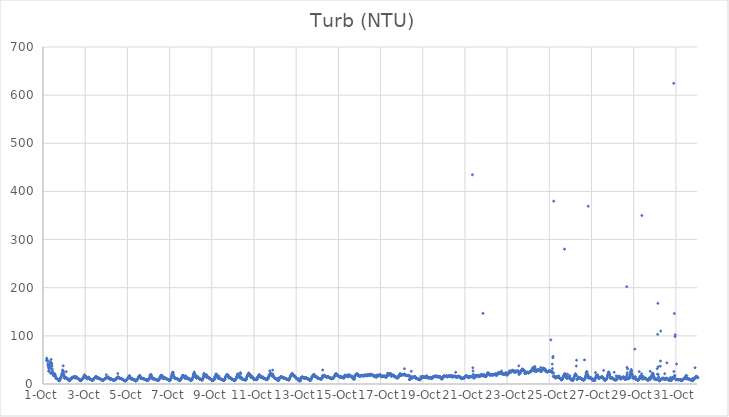
| Category | Turb (NTU) |
|---|---|
| 44835.166666666664 | 49.15 |
| 44835.177083333336 | 53.61 |
| 44835.1875 | 49.12 |
| 44835.197916666664 | 49.68 |
| 44835.208333333336 | 48.34 |
| 44835.21875 | 47.58 |
| 44835.229166666664 | 41.84 |
| 44835.239583333336 | 37.97 |
| 44835.25 | 38 |
| 44835.260416666664 | 33.62 |
| 44835.270833333336 | 26.23 |
| 44835.28125 | 28.36 |
| 44835.291666666664 | 31.49 |
| 44835.302083333336 | 37.87 |
| 44835.3125 | 36.7 |
| 44835.322916666664 | 41.82 |
| 44835.333333333336 | 44.21 |
| 44835.34375 | 46.5 |
| 44835.354166666664 | 32.95 |
| 44835.364583333336 | 22.28 |
| 44835.375 | 23.84 |
| 44835.385416666664 | 51.07 |
| 44835.395833333336 | 43.68 |
| 44835.40625 | 36.72 |
| 44835.416666666664 | 41.78 |
| 44835.427083333336 | 37.09 |
| 44835.4375 | 31.09 |
| 44835.447916666664 | 27.18 |
| 44835.458333333336 | 23.68 |
| 44835.46875 | 19.78 |
| 44835.479166666664 | 20.78 |
| 44835.489583333336 | 19.88 |
| 44835.5 | 17.16 |
| 44835.510416666664 | 18.75 |
| 44835.520833333336 | 17.98 |
| 44835.53125 | 18.2 |
| 44835.541666666664 | 21.58 |
| 44835.552083333336 | 21.3 |
| 44835.5625 | 19.48 |
| 44835.572916666664 | 18.64 |
| 44835.583333333336 | 16.84 |
| 44835.59375 | 15.21 |
| 44835.604166666664 | 14.49 |
| 44835.614583333336 | 12.2 |
| 44835.625 | 11.57 |
| 44835.635416666664 | 11.65 |
| 44835.645833333336 | 11.8 |
| 44835.65625 | 11.45 |
| 44835.666666666664 | 11.25 |
| 44835.677083333336 | 10.87 |
| 44835.6875 | 10.07 |
| 44835.697916666664 | 9.57 |
| 44835.708333333336 | 9.47 |
| 44835.71875 | 8.56 |
| 44835.729166666664 | 8.44 |
| 44835.739583333336 | 8.12 |
| 44835.75 | 7.13 |
| 44835.760416666664 | 6.82 |
| 44835.770833333336 | 7.75 |
| 44835.78125 | 6.8 |
| 44835.791666666664 | 7.42 |
| 44835.802083333336 | 8.4 |
| 44835.8125 | 11.02 |
| 44835.822916666664 | 12.06 |
| 44835.833333333336 | 12.48 |
| 44835.84375 | 12.3 |
| 44835.854166666664 | 12.15 |
| 44835.864583333336 | 15.31 |
| 44835.875 | 15.54 |
| 44835.885416666664 | 19.15 |
| 44835.895833333336 | 18.81 |
| 44835.90625 | 21.9 |
| 44835.916666666664 | 23.14 |
| 44835.927083333336 | 28.86 |
| 44835.9375 | 28.12 |
| 44835.947916666664 | 26.24 |
| 44835.958333333336 | 37.86 |
| 44835.96875 | 25.81 |
| 44835.979166666664 | 21.98 |
| 44835.989583333336 | 19.39 |
| 44836.0 | 16.69 |
| 44836.010416666664 | 16 |
| 44836.020833333336 | 12.04 |
| 44836.03125 | 12.14 |
| 44836.041666666664 | 13.37 |
| 44836.052083333336 | 13.4 |
| 44836.0625 | 13.37 |
| 44836.072916666664 | 13.4 |
| 44836.083333333336 | 13.68 |
| 44836.09375 | 11.85 |
| 44836.104166666664 | 25.61 |
| 44836.114583333336 | 12.76 |
| 44836.125 | 12.19 |
| 44836.135416666664 | 10.9 |
| 44836.145833333336 | 10.65 |
| 44836.15625 | 10.29 |
| 44836.166666666664 | 10.28 |
| 44836.177083333336 | 10.24 |
| 44836.1875 | 9.9 |
| 44836.197916666664 | 9.58 |
| 44836.208333333336 | 9.08 |
| 44836.21875 | 9.95 |
| 44836.229166666664 | 8.31 |
| 44836.239583333336 | 7.17 |
| 44836.25 | 6.77 |
| 44836.260416666664 | 7.12 |
| 44836.270833333336 | 7.86 |
| 44836.28125 | 7.98 |
| 44836.291666666664 | 8.83 |
| 44836.302083333336 | 11.41 |
| 44836.3125 | 10.06 |
| 44836.322916666664 | 11.19 |
| 44836.333333333336 | 11.21 |
| 44836.34375 | 12.52 |
| 44836.354166666664 | 12.64 |
| 44836.364583333336 | 12.93 |
| 44836.375 | 12.23 |
| 44836.385416666664 | 12.09 |
| 44836.395833333336 | 12.64 |
| 44836.40625 | 14.03 |
| 44836.416666666664 | 13.3 |
| 44836.427083333336 | 13.84 |
| 44836.4375 | 13.96 |
| 44836.447916666664 | 15.19 |
| 44836.458333333336 | 14.63 |
| 44836.46875 | 15.03 |
| 44836.479166666664 | 14.5 |
| 44836.489583333336 | 13.94 |
| 44836.5 | 13.4 |
| 44836.510416666664 | 12.65 |
| 44836.520833333336 | 12.65 |
| 44836.53125 | 12.82 |
| 44836.541666666664 | 14.99 |
| 44836.552083333336 | 15.46 |
| 44836.5625 | 14.48 |
| 44836.572916666664 | 14.25 |
| 44836.583333333336 | 13.58 |
| 44836.59375 | 12.76 |
| 44836.604166666664 | 12.78 |
| 44836.614583333336 | 12.74 |
| 44836.625 | 13.25 |
| 44836.635416666664 | 11.64 |
| 44836.645833333336 | 11.93 |
| 44836.65625 | 11.53 |
| 44836.666666666664 | 11.28 |
| 44836.677083333336 | 10.59 |
| 44836.6875 | 10.1 |
| 44836.697916666664 | 10.29 |
| 44836.708333333336 | 10.19 |
| 44836.71875 | 9.48 |
| 44836.729166666664 | 8.61 |
| 44836.739583333336 | 8.12 |
| 44836.75 | 8.36 |
| 44836.760416666664 | 7.26 |
| 44836.770833333336 | 8.08 |
| 44836.78125 | 6.84 |
| 44836.791666666664 | 7.87 |
| 44836.802083333336 | 7.08 |
| 44836.8125 | 7.45 |
| 44836.822916666664 | 8.35 |
| 44836.833333333336 | 9.28 |
| 44836.84375 | 9.24 |
| 44836.854166666664 | 9.94 |
| 44836.864583333336 | 10.49 |
| 44836.875 | 11.53 |
| 44836.885416666664 | 10.61 |
| 44836.895833333336 | 11.11 |
| 44836.90625 | 12.71 |
| 44836.916666666664 | 13.6 |
| 44836.927083333336 | 14.12 |
| 44836.9375 | 14.61 |
| 44836.947916666664 | 18.15 |
| 44836.958333333336 | 16.84 |
| 44836.96875 | 18.82 |
| 44836.979166666664 | 17.57 |
| 44836.989583333336 | 16.21 |
| 44837.0 | 16.41 |
| 44837.010416666664 | 16.79 |
| 44837.020833333336 | 16.39 |
| 44837.03125 | 15.18 |
| 44837.041666666664 | 14.75 |
| 44837.052083333336 | 13.43 |
| 44837.0625 | 12.53 |
| 44837.072916666664 | 11.91 |
| 44837.083333333336 | 11.25 |
| 44837.09375 | 10.67 |
| 44837.104166666664 | 11.48 |
| 44837.114583333336 | 11.26 |
| 44837.125 | 11.47 |
| 44837.135416666664 | 12.38 |
| 44837.145833333336 | 13.33 |
| 44837.15625 | 13.7 |
| 44837.166666666664 | 14.21 |
| 44837.177083333336 | 13.07 |
| 44837.1875 | 11.97 |
| 44837.197916666664 | 11.55 |
| 44837.208333333336 | 10.83 |
| 44837.21875 | 10.45 |
| 44837.229166666664 | 10.44 |
| 44837.239583333336 | 9.5 |
| 44837.25 | 9.91 |
| 44837.260416666664 | 9.92 |
| 44837.270833333336 | 9.36 |
| 44837.28125 | 9.79 |
| 44837.291666666664 | 8.82 |
| 44837.302083333336 | 8.54 |
| 44837.3125 | 7.99 |
| 44837.322916666664 | 7.9 |
| 44837.333333333336 | 7.79 |
| 44837.34375 | 7.48 |
| 44837.354166666664 | 7.73 |
| 44837.364583333336 | 8.03 |
| 44837.375 | 8.57 |
| 44837.385416666664 | 9.33 |
| 44837.395833333336 | 10.06 |
| 44837.40625 | 10.47 |
| 44837.416666666664 | 11.03 |
| 44837.427083333336 | 11.47 |
| 44837.4375 | 11.98 |
| 44837.447916666664 | 13.2 |
| 44837.458333333336 | 12.77 |
| 44837.46875 | 13.08 |
| 44837.479166666664 | 14.86 |
| 44837.489583333336 | 14.74 |
| 44837.5 | 14.87 |
| 44837.510416666664 | 15.4 |
| 44837.520833333336 | 15.75 |
| 44837.53125 | 15.13 |
| 44837.541666666664 | 14 |
| 44837.552083333336 | 14.45 |
| 44837.5625 | 12.69 |
| 44837.572916666664 | 11.64 |
| 44837.583333333336 | 12.87 |
| 44837.59375 | 11.6 |
| 44837.604166666664 | 12.33 |
| 44837.614583333336 | 12.45 |
| 44837.625 | 12.68 |
| 44837.635416666664 | 12.1 |
| 44837.645833333336 | 12.34 |
| 44837.65625 | 11.95 |
| 44837.666666666664 | 11.46 |
| 44837.677083333336 | 11.12 |
| 44837.6875 | 10.95 |
| 44837.697916666664 | 10.61 |
| 44837.708333333336 | 10.7 |
| 44837.71875 | 10.03 |
| 44837.729166666664 | 10.43 |
| 44837.739583333336 | 9.75 |
| 44837.75 | 9.68 |
| 44837.760416666664 | 9.18 |
| 44837.770833333336 | 9.03 |
| 44837.78125 | 9.44 |
| 44837.791666666664 | 8.45 |
| 44837.802083333336 | 7.84 |
| 44837.8125 | 7.89 |
| 44837.822916666664 | 7.91 |
| 44837.833333333336 | 7.32 |
| 44837.84375 | 7.47 |
| 44837.854166666664 | 7.83 |
| 44837.864583333336 | 7.84 |
| 44837.875 | 8.44 |
| 44837.885416666664 | 8.75 |
| 44837.895833333336 | 9.23 |
| 44837.90625 | 10.17 |
| 44837.916666666664 | 10.52 |
| 44837.927083333336 | 10.63 |
| 44837.9375 | 11.69 |
| 44837.947916666664 | 11.06 |
| 44837.958333333336 | 12 |
| 44837.96875 | 11.47 |
| 44837.979166666664 | 12.6 |
| 44837.989583333336 | 12.15 |
| 44838.0 | 19.23 |
| 44838.010416666664 | 12.82 |
| 44838.020833333336 | 13.28 |
| 44838.03125 | 12.69 |
| 44838.041666666664 | 14.26 |
| 44838.052083333336 | 13.48 |
| 44838.0625 | 13.45 |
| 44838.072916666664 | 13.39 |
| 44838.083333333336 | 14.24 |
| 44838.09375 | 14.16 |
| 44838.104166666664 | 14.06 |
| 44838.114583333336 | 11.67 |
| 44838.125 | 11.8 |
| 44838.135416666664 | 10.61 |
| 44838.145833333336 | 10.51 |
| 44838.15625 | 11.08 |
| 44838.166666666664 | 10.53 |
| 44838.177083333336 | 10.83 |
| 44838.1875 | 10.65 |
| 44838.197916666664 | 10.63 |
| 44838.208333333336 | 11.28 |
| 44838.21875 | 10.39 |
| 44838.229166666664 | 9.96 |
| 44838.239583333336 | 9.85 |
| 44838.25 | 9.55 |
| 44838.260416666664 | 9.93 |
| 44838.270833333336 | 9.14 |
| 44838.28125 | 9.3 |
| 44838.291666666664 | 8.86 |
| 44838.302083333336 | 8.59 |
| 44838.3125 | 8.73 |
| 44838.322916666664 | 8.5 |
| 44838.333333333336 | 8.02 |
| 44838.34375 | 7.76 |
| 44838.354166666664 | 7.85 |
| 44838.364583333336 | 7.04 |
| 44838.375 | 7.48 |
| 44838.385416666664 | 7.25 |
| 44838.395833333336 | 7.93 |
| 44838.40625 | 8.01 |
| 44838.416666666664 | 8.88 |
| 44838.427083333336 | 9.08 |
| 44838.4375 | 9.71 |
| 44838.447916666664 | 10.27 |
| 44838.458333333336 | 10.06 |
| 44838.46875 | 10.27 |
| 44838.479166666664 | 11.78 |
| 44838.489583333336 | 11.88 |
| 44838.5 | 12.39 |
| 44838.510416666664 | 12.59 |
| 44838.520833333336 | 12.02 |
| 44838.53125 | 13.73 |
| 44838.541666666664 | 21.72 |
| 44838.552083333336 | 14.94 |
| 44838.5625 | 13.61 |
| 44838.572916666664 | 13.48 |
| 44838.583333333336 | 14.09 |
| 44838.59375 | 13.94 |
| 44838.604166666664 | 13.95 |
| 44838.614583333336 | 12.36 |
| 44838.625 | 11.88 |
| 44838.635416666664 | 11.09 |
| 44838.645833333336 | 11.82 |
| 44838.65625 | 11.31 |
| 44838.666666666664 | 11.38 |
| 44838.677083333336 | 11.54 |
| 44838.6875 | 11.69 |
| 44838.697916666664 | 11.93 |
| 44838.708333333336 | 11.25 |
| 44838.71875 | 10.78 |
| 44838.729166666664 | 10.64 |
| 44838.739583333336 | 10.05 |
| 44838.75 | 9.86 |
| 44838.760416666664 | 9.63 |
| 44838.770833333336 | 9.54 |
| 44838.78125 | 9.47 |
| 44838.791666666664 | 9.38 |
| 44838.802083333336 | 8.81 |
| 44838.8125 | 8.43 |
| 44838.822916666664 | 7.87 |
| 44838.833333333336 | 7.89 |
| 44838.84375 | 7.27 |
| 44838.854166666664 | 7.22 |
| 44838.864583333336 | 7.35 |
| 44838.875 | 7.19 |
| 44838.885416666664 | 7.63 |
| 44838.895833333336 | 6.53 |
| 44838.90625 | 5.83 |
| 44838.916666666664 | 7.21 |
| 44838.927083333336 | 7.45 |
| 44838.9375 | 7.59 |
| 44838.947916666664 | 8.03 |
| 44838.958333333336 | 8.76 |
| 44838.96875 | 9.12 |
| 44838.979166666664 | 9.69 |
| 44838.989583333336 | 10.14 |
| 44839.0 | 10.92 |
| 44839.010416666664 | 11.07 |
| 44839.020833333336 | 11.76 |
| 44839.03125 | 12.74 |
| 44839.041666666664 | 13.25 |
| 44839.052083333336 | 13.09 |
| 44839.0625 | 14.03 |
| 44839.072916666664 | 16.65 |
| 44839.083333333336 | 16.02 |
| 44839.09375 | 15.57 |
| 44839.104166666664 | 17.23 |
| 44839.114583333336 | 15.77 |
| 44839.125 | 13.82 |
| 44839.135416666664 | 13.51 |
| 44839.145833333336 | 12.37 |
| 44839.15625 | 11.1 |
| 44839.166666666664 | 11.47 |
| 44839.177083333336 | 9.87 |
| 44839.1875 | 10.78 |
| 44839.197916666664 | 11.5 |
| 44839.208333333336 | 11.07 |
| 44839.21875 | 10.73 |
| 44839.229166666664 | 11.85 |
| 44839.239583333336 | 11.1 |
| 44839.25 | 9.57 |
| 44839.260416666664 | 9.24 |
| 44839.270833333336 | 9.47 |
| 44839.28125 | 9.21 |
| 44839.291666666664 | 8.79 |
| 44839.302083333336 | 9.01 |
| 44839.3125 | 8.64 |
| 44839.322916666664 | 9.87 |
| 44839.333333333336 | 8.01 |
| 44839.34375 | 8 |
| 44839.354166666664 | 8.45 |
| 44839.364583333336 | 8.14 |
| 44839.375 | 7.66 |
| 44839.385416666664 | 7.43 |
| 44839.395833333336 | 5.56 |
| 44839.40625 | 6.96 |
| 44839.416666666664 | 7.41 |
| 44839.427083333336 | 7.26 |
| 44839.4375 | 7.62 |
| 44839.447916666664 | 8.08 |
| 44839.458333333336 | 8.46 |
| 44839.46875 | 9.43 |
| 44839.479166666664 | 10.93 |
| 44839.489583333336 | 10.34 |
| 44839.5 | 10.99 |
| 44839.510416666664 | 12.12 |
| 44839.520833333336 | 12.62 |
| 44839.53125 | 15.3 |
| 44839.541666666664 | 15.21 |
| 44839.552083333336 | 15.75 |
| 44839.5625 | 17 |
| 44839.572916666664 | 17.58 |
| 44839.583333333336 | 15.63 |
| 44839.59375 | 17.64 |
| 44839.604166666664 | 15.48 |
| 44839.614583333336 | 14.05 |
| 44839.625 | 13.02 |
| 44839.635416666664 | 12.34 |
| 44839.645833333336 | 12.03 |
| 44839.65625 | 11.03 |
| 44839.666666666664 | 11.45 |
| 44839.677083333336 | 11.71 |
| 44839.6875 | 11.9 |
| 44839.697916666664 | 12.4 |
| 44839.708333333336 | 11.45 |
| 44839.71875 | 11.32 |
| 44839.729166666664 | 11.8 |
| 44839.739583333336 | 11.73 |
| 44839.75 | 11.65 |
| 44839.760416666664 | 10.83 |
| 44839.770833333336 | 10.98 |
| 44839.78125 | 10.62 |
| 44839.791666666664 | 10.44 |
| 44839.802083333336 | 10.11 |
| 44839.8125 | 10.12 |
| 44839.822916666664 | 9.71 |
| 44839.833333333336 | 9.05 |
| 44839.84375 | 9.02 |
| 44839.854166666664 | 8.98 |
| 44839.864583333336 | 9.03 |
| 44839.875 | 8.65 |
| 44839.885416666664 | 8.9 |
| 44839.895833333336 | 8.62 |
| 44839.90625 | 8.04 |
| 44839.916666666664 | 8.51 |
| 44839.927083333336 | 8.08 |
| 44839.9375 | 6.69 |
| 44839.947916666664 | 7.21 |
| 44839.958333333336 | 7.42 |
| 44839.96875 | 8.19 |
| 44839.979166666664 | 8.13 |
| 44839.989583333336 | 8.28 |
| 44840.0 | 9.15 |
| 44840.010416666664 | 10.1 |
| 44840.020833333336 | 10.07 |
| 44840.03125 | 11.19 |
| 44840.041666666664 | 10.13 |
| 44840.052083333336 | 13.42 |
| 44840.0625 | 14.02 |
| 44840.072916666664 | 16.97 |
| 44840.083333333336 | 17.53 |
| 44840.09375 | 17.28 |
| 44840.104166666664 | 19.99 |
| 44840.114583333336 | 15.23 |
| 44840.125 | 19.16 |
| 44840.135416666664 | 17.08 |
| 44840.145833333336 | 15.7 |
| 44840.15625 | 14.64 |
| 44840.166666666664 | 13.23 |
| 44840.177083333336 | 12.21 |
| 44840.1875 | 10.98 |
| 44840.197916666664 | 11.11 |
| 44840.208333333336 | 11.3 |
| 44840.21875 | 10.58 |
| 44840.229166666664 | 11.85 |
| 44840.239583333336 | 10.83 |
| 44840.25 | 10.9 |
| 44840.260416666664 | 10.23 |
| 44840.270833333336 | 10.68 |
| 44840.28125 | 10.27 |
| 44840.291666666664 | 9.57 |
| 44840.302083333336 | 9.61 |
| 44840.3125 | 9.73 |
| 44840.322916666664 | 9.58 |
| 44840.333333333336 | 9.64 |
| 44840.34375 | 9.28 |
| 44840.354166666664 | 8.93 |
| 44840.364583333336 | 8.97 |
| 44840.375 | 8.58 |
| 44840.385416666664 | 8.75 |
| 44840.395833333336 | 8.64 |
| 44840.40625 | 8.14 |
| 44840.416666666664 | 8.2 |
| 44840.427083333336 | 8.09 |
| 44840.4375 | 8.14 |
| 44840.447916666664 | 7.5 |
| 44840.458333333336 | 7.02 |
| 44840.46875 | 7.13 |
| 44840.479166666664 | 7.78 |
| 44840.489583333336 | 8.1 |
| 44840.5 | 9.12 |
| 44840.510416666664 | 10.06 |
| 44840.520833333336 | 11.49 |
| 44840.53125 | 12.23 |
| 44840.541666666664 | 11.59 |
| 44840.552083333336 | 15.02 |
| 44840.5625 | 13.93 |
| 44840.572916666664 | 15.94 |
| 44840.583333333336 | 16.16 |
| 44840.59375 | 17.53 |
| 44840.604166666664 | 17.07 |
| 44840.614583333336 | 14.58 |
| 44840.625 | 16.93 |
| 44840.635416666664 | 18.53 |
| 44840.645833333336 | 15.93 |
| 44840.65625 | 15.32 |
| 44840.666666666664 | 13.75 |
| 44840.677083333336 | 12.02 |
| 44840.6875 | 11.21 |
| 44840.697916666664 | 11.16 |
| 44840.708333333336 | 12.47 |
| 44840.71875 | 14.8 |
| 44840.729166666664 | 13.94 |
| 44840.739583333336 | 13.35 |
| 44840.75 | 12.71 |
| 44840.760416666664 | 13.15 |
| 44840.770833333336 | 12.57 |
| 44840.78125 | 12.07 |
| 44840.791666666664 | 12.03 |
| 44840.802083333336 | 12.01 |
| 44840.8125 | 11.91 |
| 44840.822916666664 | 11.03 |
| 44840.833333333336 | 11.27 |
| 44840.84375 | 10.84 |
| 44840.854166666664 | 10.86 |
| 44840.864583333336 | 10.69 |
| 44840.875 | 10.09 |
| 44840.885416666664 | 9.9 |
| 44840.895833333336 | 9.95 |
| 44840.90625 | 9.61 |
| 44840.916666666664 | 9.47 |
| 44840.927083333336 | 9.15 |
| 44840.9375 | 8.78 |
| 44840.947916666664 | 8.86 |
| 44840.958333333336 | 8.69 |
| 44840.96875 | 8.41 |
| 44840.979166666664 | 7.32 |
| 44840.989583333336 | 7.7 |
| 44841.0 | 7.47 |
| 44841.010416666664 | 7.69 |
| 44841.020833333336 | 7.88 |
| 44841.03125 | 9.1 |
| 44841.041666666664 | 9.02 |
| 44841.052083333336 | 11.24 |
| 44841.0625 | 12.4 |
| 44841.072916666664 | 11.3 |
| 44841.083333333336 | 15.11 |
| 44841.09375 | 16.3 |
| 44841.104166666664 | 18.48 |
| 44841.114583333336 | 20.97 |
| 44841.125 | 18.59 |
| 44841.135416666664 | 21.41 |
| 44841.145833333336 | 24.11 |
| 44841.15625 | 24.69 |
| 44841.166666666664 | 24.05 |
| 44841.177083333336 | 19.98 |
| 44841.1875 | 18.78 |
| 44841.197916666664 | 15.18 |
| 44841.208333333336 | 13.67 |
| 44841.21875 | 12.99 |
| 44841.229166666664 | 13.37 |
| 44841.239583333336 | 12.02 |
| 44841.25 | 12.36 |
| 44841.260416666664 | 11.94 |
| 44841.270833333336 | 11.82 |
| 44841.28125 | 11.96 |
| 44841.291666666664 | 12.14 |
| 44841.302083333336 | 12.27 |
| 44841.3125 | 11.07 |
| 44841.322916666664 | 11.21 |
| 44841.333333333336 | 11.12 |
| 44841.34375 | 11.33 |
| 44841.354166666664 | 11.16 |
| 44841.364583333336 | 10.49 |
| 44841.375 | 10.8 |
| 44841.385416666664 | 10.68 |
| 44841.395833333336 | 9.83 |
| 44841.40625 | 9.61 |
| 44841.416666666664 | 9.34 |
| 44841.427083333336 | 8.92 |
| 44841.4375 | 8.87 |
| 44841.447916666664 | 7.95 |
| 44841.458333333336 | 8.11 |
| 44841.46875 | 7.92 |
| 44841.479166666664 | 6.54 |
| 44841.489583333336 | 7.09 |
| 44841.5 | 7.44 |
| 44841.510416666664 | 8 |
| 44841.520833333336 | 8.5 |
| 44841.53125 | 10.34 |
| 44841.541666666664 | 10.76 |
| 44841.552083333336 | 11.77 |
| 44841.5625 | 12.43 |
| 44841.572916666664 | 11.64 |
| 44841.583333333336 | 13.56 |
| 44841.59375 | 15.43 |
| 44841.604166666664 | 16.57 |
| 44841.614583333336 | 17.16 |
| 44841.625 | 18.05 |
| 44841.635416666664 | 17.42 |
| 44841.645833333336 | 17.81 |
| 44841.65625 | 17.25 |
| 44841.666666666664 | 17 |
| 44841.677083333336 | 16.53 |
| 44841.6875 | 15.33 |
| 44841.697916666664 | 14.94 |
| 44841.708333333336 | 13.92 |
| 44841.71875 | 13.31 |
| 44841.729166666664 | 11.51 |
| 44841.739583333336 | 12.34 |
| 44841.75 | 14.65 |
| 44841.760416666664 | 16.76 |
| 44841.770833333336 | 16.33 |
| 44841.78125 | 13.78 |
| 44841.791666666664 | 14.47 |
| 44841.802083333336 | 13.69 |
| 44841.8125 | 13.74 |
| 44841.822916666664 | 12.07 |
| 44841.833333333336 | 11.14 |
| 44841.84375 | 11.65 |
| 44841.854166666664 | 10.87 |
| 44841.864583333336 | 11 |
| 44841.875 | 10.82 |
| 44841.885416666664 | 10.75 |
| 44841.895833333336 | 11.72 |
| 44841.90625 | 10.82 |
| 44841.916666666664 | 10.92 |
| 44841.927083333336 | 10.61 |
| 44841.9375 | 10.42 |
| 44841.947916666664 | 9.58 |
| 44841.958333333336 | 9.43 |
| 44841.96875 | 9.06 |
| 44841.979166666664 | 8.72 |
| 44841.989583333336 | 7.45 |
| 44842.0 | 7.92 |
| 44842.010416666664 | 7.62 |
| 44842.020833333336 | 7.18 |
| 44842.03125 | 7.59 |
| 44842.041666666664 | 8.01 |
| 44842.052083333336 | 7.99 |
| 44842.0625 | 9.74 |
| 44842.072916666664 | 10.46 |
| 44842.083333333336 | 11.61 |
| 44842.09375 | 13.42 |
| 44842.104166666664 | 13.09 |
| 44842.114583333336 | 16.55 |
| 44842.125 | 19.27 |
| 44842.135416666664 | 21.37 |
| 44842.145833333336 | 16.34 |
| 44842.15625 | 19.49 |
| 44842.166666666664 | 25 |
| 44842.177083333336 | 22.46 |
| 44842.1875 | 22.33 |
| 44842.197916666664 | 19.97 |
| 44842.208333333336 | 19.16 |
| 44842.21875 | 17.96 |
| 44842.229166666664 | 16.47 |
| 44842.239583333336 | 14.14 |
| 44842.25 | 13.53 |
| 44842.260416666664 | 12.98 |
| 44842.270833333336 | 12.23 |
| 44842.28125 | 12.04 |
| 44842.291666666664 | 13.86 |
| 44842.302083333336 | 13.55 |
| 44842.3125 | 13.58 |
| 44842.322916666664 | 14.78 |
| 44842.333333333336 | 15.26 |
| 44842.34375 | 14.66 |
| 44842.354166666664 | 13.44 |
| 44842.364583333336 | 12.16 |
| 44842.375 | 11.92 |
| 44842.385416666664 | 11.33 |
| 44842.395833333336 | 11.23 |
| 44842.40625 | 10.6 |
| 44842.416666666664 | 10.85 |
| 44842.427083333336 | 10.91 |
| 44842.4375 | 10.61 |
| 44842.447916666664 | 9.69 |
| 44842.458333333336 | 9.78 |
| 44842.46875 | 9.95 |
| 44842.479166666664 | 9.91 |
| 44842.489583333336 | 9.23 |
| 44842.5 | 8.78 |
| 44842.510416666664 | 8.48 |
| 44842.520833333336 | 8.54 |
| 44842.53125 | 7.98 |
| 44842.541666666664 | 8.17 |
| 44842.552083333336 | 9.06 |
| 44842.5625 | 9.44 |
| 44842.572916666664 | 11.48 |
| 44842.583333333336 | 11.81 |
| 44842.59375 | 14.07 |
| 44842.604166666664 | 15.16 |
| 44842.614583333336 | 19.82 |
| 44842.625 | 16.91 |
| 44842.635416666664 | 22.14 |
| 44842.645833333336 | 16.95 |
| 44842.65625 | 17.48 |
| 44842.666666666664 | 16.44 |
| 44842.677083333336 | 18.46 |
| 44842.6875 | 17.31 |
| 44842.697916666664 | 18.04 |
| 44842.708333333336 | 19.19 |
| 44842.71875 | 17.83 |
| 44842.729166666664 | 17.84 |
| 44842.739583333336 | 17.4 |
| 44842.75 | 14.4 |
| 44842.760416666664 | 18.76 |
| 44842.770833333336 | 13.83 |
| 44842.78125 | 13.29 |
| 44842.791666666664 | 14.1 |
| 44842.802083333336 | 15.28 |
| 44842.8125 | 13.64 |
| 44842.822916666664 | 13.48 |
| 44842.833333333336 | 14.26 |
| 44842.84375 | 13.76 |
| 44842.854166666664 | 13.86 |
| 44842.864583333336 | 12.84 |
| 44842.875 | 12.55 |
| 44842.885416666664 | 11.46 |
| 44842.895833333336 | 11.37 |
| 44842.90625 | 10.87 |
| 44842.916666666664 | 11 |
| 44842.927083333336 | 10.5 |
| 44842.9375 | 10.75 |
| 44842.947916666664 | 10.54 |
| 44842.958333333336 | 10 |
| 44842.96875 | 9.54 |
| 44842.979166666664 | 9.04 |
| 44842.989583333336 | 8.94 |
| 44843.0 | 8.45 |
| 44843.010416666664 | 7.92 |
| 44843.020833333336 | 7.67 |
| 44843.03125 | 6.94 |
| 44843.041666666664 | 7.03 |
| 44843.052083333336 | 6.85 |
| 44843.0625 | 7.5 |
| 44843.072916666664 | 7.86 |
| 44843.083333333336 | 8.15 |
| 44843.09375 | 10.18 |
| 44843.104166666664 | 9.34 |
| 44843.114583333336 | 11.19 |
| 44843.125 | 11.16 |
| 44843.135416666664 | 9.76 |
| 44843.145833333336 | 15.43 |
| 44843.15625 | 14.59 |
| 44843.166666666664 | 14.43 |
| 44843.177083333336 | 17.01 |
| 44843.1875 | 15.91 |
| 44843.197916666664 | 20.62 |
| 44843.208333333336 | 20.83 |
| 44843.21875 | 19.27 |
| 44843.229166666664 | 18.71 |
| 44843.239583333336 | 16.57 |
| 44843.25 | 18.74 |
| 44843.260416666664 | 17.98 |
| 44843.270833333336 | 15.02 |
| 44843.28125 | 13.23 |
| 44843.291666666664 | 12.74 |
| 44843.302083333336 | 11.97 |
| 44843.3125 | 11.91 |
| 44843.322916666664 | 12.18 |
| 44843.333333333336 | 12.74 |
| 44843.34375 | 16.22 |
| 44843.354166666664 | 12.57 |
| 44843.364583333336 | 12.4 |
| 44843.375 | 11.67 |
| 44843.385416666664 | 11.25 |
| 44843.395833333336 | 11.33 |
| 44843.40625 | 10.5 |
| 44843.416666666664 | 10.57 |
| 44843.427083333336 | 9.78 |
| 44843.4375 | 10.18 |
| 44843.447916666664 | 10.03 |
| 44843.458333333336 | 9.59 |
| 44843.46875 | 9.39 |
| 44843.479166666664 | 9.35 |
| 44843.489583333336 | 9.06 |
| 44843.5 | 8.58 |
| 44843.510416666664 | 8.59 |
| 44843.520833333336 | 8.7 |
| 44843.53125 | 8.37 |
| 44843.541666666664 | 7.79 |
| 44843.552083333336 | 7.42 |
| 44843.5625 | 7.15 |
| 44843.572916666664 | 7.89 |
| 44843.583333333336 | 7.92 |
| 44843.59375 | 8.22 |
| 44843.604166666664 | 9.4 |
| 44843.614583333336 | 8.79 |
| 44843.625 | 9.26 |
| 44843.635416666664 | 12.67 |
| 44843.645833333336 | 14.82 |
| 44843.65625 | 14.9 |
| 44843.666666666664 | 14.79 |
| 44843.677083333336 | 16.52 |
| 44843.6875 | 17.85 |
| 44843.697916666664 | 16.19 |
| 44843.708333333336 | 17.35 |
| 44843.71875 | 20.02 |
| 44843.729166666664 | 18.86 |
| 44843.739583333336 | 19.08 |
| 44843.75 | 17.48 |
| 44843.760416666664 | 19.07 |
| 44843.770833333336 | 17.17 |
| 44843.78125 | 16.49 |
| 44843.791666666664 | 15.89 |
| 44843.802083333336 | 13.9 |
| 44843.8125 | 11.95 |
| 44843.822916666664 | 12.97 |
| 44843.833333333336 | 13.73 |
| 44843.84375 | 13.83 |
| 44843.854166666664 | 13.9 |
| 44843.864583333336 | 13.94 |
| 44843.875 | 13.4 |
| 44843.885416666664 | 12.75 |
| 44843.895833333336 | 12.13 |
| 44843.90625 | 12.23 |
| 44843.916666666664 | 10.92 |
| 44843.927083333336 | 10.31 |
| 44843.9375 | 10.35 |
| 44843.947916666664 | 10.63 |
| 44843.958333333336 | 10.56 |
| 44843.96875 | 9.69 |
| 44843.979166666664 | 9.73 |
| 44843.989583333336 | 9.46 |
| 44844.0 | 8.92 |
| 44844.010416666664 | 8.83 |
| 44844.020833333336 | 8.08 |
| 44844.03125 | 7.87 |
| 44844.041666666664 | 7.42 |
| 44844.052083333336 | 7.67 |
| 44844.0625 | 6.83 |
| 44844.072916666664 | 6.89 |
| 44844.083333333336 | 7.39 |
| 44844.09375 | 7.65 |
| 44844.104166666664 | 7.88 |
| 44844.114583333336 | 9.37 |
| 44844.125 | 9.02 |
| 44844.135416666664 | 9.65 |
| 44844.145833333336 | 11.08 |
| 44844.15625 | 11.2 |
| 44844.166666666664 | 14.42 |
| 44844.177083333336 | 12.91 |
| 44844.1875 | 15.71 |
| 44844.197916666664 | 14.44 |
| 44844.208333333336 | 17.41 |
| 44844.21875 | 20.38 |
| 44844.229166666664 | 19.16 |
| 44844.239583333336 | 21.01 |
| 44844.25 | 19.19 |
| 44844.260416666664 | 16.91 |
| 44844.270833333336 | 18.53 |
| 44844.28125 | 17.39 |
| 44844.291666666664 | 15.12 |
| 44844.302083333336 | 14.46 |
| 44844.3125 | 14.63 |
| 44844.322916666664 | 13.18 |
| 44844.333333333336 | 12.62 |
| 44844.34375 | 13.12 |
| 44844.354166666664 | 23.54 |
| 44844.364583333336 | 15.45 |
| 44844.375 | 21.65 |
| 44844.385416666664 | 14.39 |
| 44844.395833333336 | 13.51 |
| 44844.40625 | 12.48 |
| 44844.416666666664 | 11.47 |
| 44844.427083333336 | 9.94 |
| 44844.4375 | 10.62 |
| 44844.447916666664 | 9.89 |
| 44844.458333333336 | 10.65 |
| 44844.46875 | 10.47 |
| 44844.479166666664 | 9.79 |
| 44844.489583333336 | 9.67 |
| 44844.5 | 9.31 |
| 44844.510416666664 | 9.41 |
| 44844.520833333336 | 9.4 |
| 44844.53125 | 9.09 |
| 44844.541666666664 | 9 |
| 44844.552083333336 | 8.84 |
| 44844.5625 | 8.84 |
| 44844.572916666664 | 8.43 |
| 44844.583333333336 | 8.68 |
| 44844.59375 | 8.03 |
| 44844.604166666664 | 8.6 |
| 44844.614583333336 | 9.1 |
| 44844.625 | 9.53 |
| 44844.635416666664 | 8.77 |
| 44844.645833333336 | 12 |
| 44844.65625 | 13.69 |
| 44844.666666666664 | 15.03 |
| 44844.677083333336 | 15.73 |
| 44844.6875 | 16.82 |
| 44844.697916666664 | 18.82 |
| 44844.708333333336 | 17.79 |
| 44844.71875 | 18.21 |
| 44844.729166666664 | 19.34 |
| 44844.739583333336 | 21.73 |
| 44844.75 | 22.92 |
| 44844.760416666664 | 21.48 |
| 44844.770833333336 | 21.3 |
| 44844.78125 | 19.75 |
| 44844.791666666664 | 18.27 |
| 44844.802083333336 | 19.74 |
| 44844.8125 | 18.19 |
| 44844.822916666664 | 18.44 |
| 44844.833333333336 | 18.2 |
| 44844.84375 | 13.7 |
| 44844.854166666664 | 17.57 |
| 44844.864583333336 | 16.31 |
| 44844.875 | 16.21 |
| 44844.885416666664 | 15.74 |
| 44844.895833333336 | 15.03 |
| 44844.90625 | 15.27 |
| 44844.916666666664 | 13.84 |
| 44844.927083333336 | 14.2 |
| 44844.9375 | 13.54 |
| 44844.947916666664 | 12.97 |
| 44844.958333333336 | 11.35 |
| 44844.96875 | 10.47 |
| 44844.979166666664 | 10.69 |
| 44844.989583333336 | 10.66 |
| 44845.0 | 10.52 |
| 44845.010416666664 | 9.98 |
| 44845.020833333336 | 10.11 |
| 44845.03125 | 10.27 |
| 44845.041666666664 | 9.51 |
| 44845.052083333336 | 9.63 |
| 44845.0625 | 9.75 |
| 44845.072916666664 | 9.34 |
| 44845.083333333336 | 9.18 |
| 44845.09375 | 9.02 |
| 44845.104166666664 | 8.61 |
| 44845.114583333336 | 9.38 |
| 44845.125 | 9.47 |
| 44845.135416666664 | 10.38 |
| 44845.145833333336 | 12.66 |
| 44845.15625 | 9.66 |
| 44845.166666666664 | 12.85 |
| 44845.177083333336 | 12.65 |
| 44845.1875 | 15.44 |
| 44845.197916666664 | 15.27 |
| 44845.208333333336 | 15.8 |
| 44845.21875 | 14.21 |
| 44845.229166666664 | 18.19 |
| 44845.239583333336 | 18.89 |
| 44845.25 | 19.37 |
| 44845.260416666664 | 17.31 |
| 44845.270833333336 | 17.9 |
| 44845.28125 | 17.63 |
| 44845.291666666664 | 16.58 |
| 44845.302083333336 | 17.13 |
| 44845.3125 | 15.16 |
| 44845.322916666664 | 14.34 |
| 44845.333333333336 | 13.91 |
| 44845.34375 | 13.8 |
| 44845.354166666664 | 13.89 |
| 44845.364583333336 | 13.99 |
| 44845.375 | 14.24 |
| 44845.385416666664 | 13.82 |
| 44845.395833333336 | 13.49 |
| 44845.40625 | 14.31 |
| 44845.416666666664 | 13.25 |
| 44845.427083333336 | 14.88 |
| 44845.4375 | 12.41 |
| 44845.447916666664 | 11.51 |
| 44845.458333333336 | 11.57 |
| 44845.46875 | 11.57 |
| 44845.479166666664 | 12 |
| 44845.489583333336 | 11.37 |
| 44845.5 | 11.54 |
| 44845.510416666664 | 10.79 |
| 44845.520833333336 | 10.91 |
| 44845.53125 | 10.72 |
| 44845.541666666664 | 10.4 |
| 44845.552083333336 | 10.38 |
| 44845.5625 | 10.18 |
| 44845.572916666664 | 10.43 |
| 44845.583333333336 | 9.94 |
| 44845.59375 | 10.62 |
| 44845.604166666664 | 10.33 |
| 44845.614583333336 | 9.27 |
| 44845.625 | 8.65 |
| 44845.635416666664 | 10.36 |
| 44845.645833333336 | 9.68 |
| 44845.65625 | 10.76 |
| 44845.666666666664 | 11.52 |
| 44845.677083333336 | 11.54 |
| 44845.6875 | 14.54 |
| 44845.697916666664 | 15.33 |
| 44845.708333333336 | 16.32 |
| 44845.71875 | 17.36 |
| 44845.729166666664 | 19.41 |
| 44845.739583333336 | 18.91 |
| 44845.75 | 27.37 |
| 44845.760416666664 | 21.23 |
| 44845.770833333336 | 20.44 |
| 44845.78125 | 19.39 |
| 44845.791666666664 | 23.2 |
| 44845.802083333336 | 18.76 |
| 44845.8125 | 19.27 |
| 44845.822916666664 | 20.18 |
| 44845.833333333336 | 20.15 |
| 44845.84375 | 17.92 |
| 44845.854166666664 | 16.99 |
| 44845.864583333336 | 16.17 |
| 44845.875 | 17.37 |
| 44845.885416666664 | 28.78 |
| 44845.895833333336 | 20.81 |
| 44845.90625 | 18.22 |
| 44845.916666666664 | 16.63 |
| 44845.927083333336 | 15.74 |
| 44845.9375 | 15.36 |
| 44845.947916666664 | 14.26 |
| 44845.958333333336 | 13.47 |
| 44845.96875 | 12.89 |
| 44845.979166666664 | 12.6 |
| 44845.989583333336 | 11.81 |
| 44846.0 | 11.34 |
| 44846.010416666664 | 11.18 |
| 44846.020833333336 | 11.08 |
| 44846.03125 | 10.92 |
| 44846.041666666664 | 10.8 |
| 44846.052083333336 | 10.66 |
| 44846.0625 | 10.74 |
| 44846.072916666664 | 10.54 |
| 44846.083333333336 | 10.47 |
| 44846.09375 | 10.31 |
| 44846.104166666664 | 10.21 |
| 44846.114583333336 | 9.6 |
| 44846.125 | 8.98 |
| 44846.135416666664 | 6.88 |
| 44846.145833333336 | 7.61 |
| 44846.15625 | 7.13 |
| 44846.166666666664 | 7.35 |
| 44846.177083333336 | 8.2 |
| 44846.1875 | 12.25 |
| 44846.197916666664 | 11.86 |
| 44846.208333333336 | 13 |
| 44846.21875 | 13.63 |
| 44846.229166666664 | 11.9 |
| 44846.239583333336 | 12.12 |
| 44846.25 | 14.13 |
| 44846.260416666664 | 14.07 |
| 44846.270833333336 | 15.35 |
| 44846.28125 | 15.22 |
| 44846.291666666664 | 14.16 |
| 44846.302083333336 | 15.39 |
| 44846.3125 | 14.74 |
| 44846.322916666664 | 14.19 |
| 44846.333333333336 | 13.7 |
| 44846.34375 | 12.71 |
| 44846.354166666664 | 14.24 |
| 44846.364583333336 | 12.94 |
| 44846.375 | 12.74 |
| 44846.385416666664 | 13.23 |
| 44846.395833333336 | 13.16 |
| 44846.40625 | 12.87 |
| 44846.416666666664 | 12.88 |
| 44846.427083333336 | 12.55 |
| 44846.4375 | 12.26 |
| 44846.447916666664 | 12.38 |
| 44846.458333333336 | 12.2 |
| 44846.46875 | 11.89 |
| 44846.479166666664 | 11.52 |
| 44846.489583333336 | 11.37 |
| 44846.5 | 11.63 |
| 44846.510416666664 | 10.59 |
| 44846.520833333336 | 10.72 |
| 44846.53125 | 10.38 |
| 44846.541666666664 | 10.58 |
| 44846.552083333336 | 10.13 |
| 44846.5625 | 9.51 |
| 44846.572916666664 | 9.28 |
| 44846.583333333336 | 9.78 |
| 44846.59375 | 9.23 |
| 44846.604166666664 | 9.37 |
| 44846.614583333336 | 9.42 |
| 44846.625 | 8.83 |
| 44846.635416666664 | 8.48 |
| 44846.645833333336 | 8.15 |
| 44846.65625 | 8.7 |
| 44846.666666666664 | 8.82 |
| 44846.677083333336 | 10.05 |
| 44846.6875 | 11.76 |
| 44846.697916666664 | 12.73 |
| 44846.708333333336 | 13.69 |
| 44846.71875 | 14.37 |
| 44846.729166666664 | 16.73 |
| 44846.739583333336 | 16.85 |
| 44846.75 | 16.88 |
| 44846.760416666664 | 18.56 |
| 44846.770833333336 | 17.57 |
| 44846.78125 | 19.99 |
| 44846.791666666664 | 20.9 |
| 44846.802083333336 | 19.86 |
| 44846.8125 | 21.13 |
| 44846.822916666664 | 22.01 |
| 44846.833333333336 | 19.13 |
| 44846.84375 | 19.37 |
| 44846.854166666664 | 18.36 |
| 44846.864583333336 | 18.13 |
| 44846.875 | 17.91 |
| 44846.885416666664 | 18.5 |
| 44846.895833333336 | 15.93 |
| 44846.90625 | 16.43 |
| 44846.916666666664 | 16.83 |
| 44846.927083333336 | 16.71 |
| 44846.9375 | 16.2 |
| 44846.947916666664 | 16.05 |
| 44846.958333333336 | 14.93 |
| 44846.96875 | 14.58 |
| 44846.979166666664 | 13.63 |
| 44846.989583333336 | 12.58 |
| 44847.0 | 12.09 |
| 44847.010416666664 | 11.44 |
| 44847.020833333336 | 11.22 |
| 44847.03125 | 10.76 |
| 44847.041666666664 | 11.11 |
| 44847.052083333336 | 11.07 |
| 44847.0625 | 10.81 |
| 44847.072916666664 | 10.61 |
| 44847.083333333336 | 10.14 |
| 44847.09375 | 10.67 |
| 44847.104166666664 | 10.22 |
| 44847.114583333336 | 10.31 |
| 44847.125 | 6.68 |
| 44847.135416666664 | 6.95 |
| 44847.145833333336 | 6.85 |
| 44847.15625 | 6.76 |
| 44847.166666666664 | 7.5 |
| 44847.177083333336 | 6.36 |
| 44847.1875 | 7.38 |
| 44847.197916666664 | 6.52 |
| 44847.208333333336 | 9.38 |
| 44847.21875 | 10.21 |
| 44847.229166666664 | 13.24 |
| 44847.239583333336 | 11.44 |
| 44847.25 | 13.68 |
| 44847.260416666664 | 14.05 |
| 44847.270833333336 | 13.07 |
| 44847.28125 | 14.2 |
| 44847.291666666664 | 14.98 |
| 44847.302083333336 | 14.08 |
| 44847.3125 | 14.51 |
| 44847.322916666664 | 13.41 |
| 44847.333333333336 | 13.42 |
| 44847.34375 | 13.05 |
| 44847.354166666664 | 12.83 |
| 44847.364583333336 | 12.58 |
| 44847.375 | 12.37 |
| 44847.385416666664 | 12.42 |
| 44847.395833333336 | 12.19 |
| 44847.40625 | 12.09 |
| 44847.416666666664 | 12.04 |
| 44847.427083333336 | 12.41 |
| 44847.4375 | 12.69 |
| 44847.447916666664 | 12.87 |
| 44847.458333333336 | 12.96 |
| 44847.46875 | 12.85 |
| 44847.479166666664 | 12.13 |
| 44847.489583333336 | 12.6 |
| 44847.5 | 11.61 |
| 44847.510416666664 | 11.46 |
| 44847.520833333336 | 11.14 |
| 44847.53125 | 11.64 |
| 44847.541666666664 | 10.56 |
| 44847.552083333336 | 10.64 |
| 44847.5625 | 10.34 |
| 44847.572916666664 | 10.79 |
| 44847.583333333336 | 10.66 |
| 44847.59375 | 10.12 |
| 44847.604166666664 | 9.36 |
| 44847.614583333336 | 9.35 |
| 44847.625 | 8.67 |
| 44847.635416666664 | 9.02 |
| 44847.645833333336 | 7.82 |
| 44847.65625 | 7.49 |
| 44847.666666666664 | 7.71 |
| 44847.677083333336 | 7.58 |
| 44847.6875 | 7.93 |
| 44847.697916666664 | 8.12 |
| 44847.708333333336 | 9.51 |
| 44847.71875 | 10.68 |
| 44847.729166666664 | 12.07 |
| 44847.739583333336 | 13.62 |
| 44847.75 | 15.07 |
| 44847.760416666664 | 14.59 |
| 44847.770833333336 | 14.87 |
| 44847.78125 | 17.54 |
| 44847.791666666664 | 18.13 |
| 44847.802083333336 | 17.61 |
| 44847.8125 | 18.56 |
| 44847.822916666664 | 18.13 |
| 44847.833333333336 | 19.87 |
| 44847.84375 | 19.8 |
| 44847.854166666664 | 17.87 |
| 44847.864583333336 | 17.74 |
| 44847.875 | 16.42 |
| 44847.885416666664 | 16.8 |
| 44847.895833333336 | 16.45 |
| 44847.90625 | 16.37 |
| 44847.916666666664 | 15.42 |
| 44847.927083333336 | 14.72 |
| 44847.9375 | 14.48 |
| 44847.947916666664 | 14.5 |
| 44847.958333333336 | 14.95 |
| 44847.96875 | 14.59 |
| 44847.979166666664 | 13.64 |
| 44847.989583333336 | 14.72 |
| 44848.0 | 13.84 |
| 44848.010416666664 | 12.77 |
| 44848.020833333336 | 12.34 |
| 44848.03125 | 12.08 |
| 44848.041666666664 | 11.61 |
| 44848.052083333336 | 11.54 |
| 44848.0625 | 11.95 |
| 44848.072916666664 | 11.42 |
| 44848.083333333336 | 11.03 |
| 44848.09375 | 11.08 |
| 44848.104166666664 | 11.06 |
| 44848.114583333336 | 11.1 |
| 44848.125 | 11.28 |
| 44848.135416666664 | 10.88 |
| 44848.145833333336 | 10.91 |
| 44848.15625 | 11.09 |
| 44848.166666666664 | 10.81 |
| 44848.177083333336 | 9.64 |
| 44848.1875 | 10.25 |
| 44848.197916666664 | 10.51 |
| 44848.208333333336 | 10.32 |
| 44848.21875 | 10.93 |
| 44848.229166666664 | 12.34 |
| 44848.239583333336 | 16.42 |
| 44848.25 | 13.96 |
| 44848.260416666664 | 29.1 |
| 44848.270833333336 | 17.51 |
| 44848.28125 | 15.56 |
| 44848.291666666664 | 17.68 |
| 44848.302083333336 | 17.09 |
| 44848.3125 | 16.84 |
| 44848.322916666664 | 16.05 |
| 44848.333333333336 | 18.32 |
| 44848.34375 | 17.52 |
| 44848.354166666664 | 16.79 |
| 44848.364583333336 | 16.49 |
| 44848.375 | 15.67 |
| 44848.385416666664 | 15.31 |
| 44848.395833333336 | 15.48 |
| 44848.40625 | 15.79 |
| 44848.416666666664 | 14.82 |
| 44848.427083333336 | 14.51 |
| 44848.4375 | 14.59 |
| 44848.447916666664 | 14.79 |
| 44848.458333333336 | 14.84 |
| 44848.46875 | 14.11 |
| 44848.479166666664 | 15.09 |
| 44848.489583333336 | 15.13 |
| 44848.5 | 15.31 |
| 44848.510416666664 | 15.62 |
| 44848.520833333336 | 15.46 |
| 44848.53125 | 14.11 |
| 44848.541666666664 | 14.6 |
| 44848.552083333336 | 13.81 |
| 44848.5625 | 13.67 |
| 44848.572916666664 | 13.01 |
| 44848.583333333336 | 13.23 |
| 44848.59375 | 13.57 |
| 44848.604166666664 | 12.3 |
| 44848.614583333336 | 12.23 |
| 44848.625 | 11.86 |
| 44848.635416666664 | 12.51 |
| 44848.645833333336 | 12.14 |
| 44848.65625 | 11.85 |
| 44848.666666666664 | 11.52 |
| 44848.677083333336 | 11.79 |
| 44848.6875 | 10.85 |
| 44848.697916666664 | 10.79 |
| 44848.708333333336 | 10.98 |
| 44848.71875 | 11.43 |
| 44848.729166666664 | 11.46 |
| 44848.739583333336 | 11.67 |
| 44848.75 | 12.16 |
| 44848.760416666664 | 13.18 |
| 44848.770833333336 | 13.87 |
| 44848.78125 | 14.15 |
| 44848.791666666664 | 14.56 |
| 44848.802083333336 | 14.66 |
| 44848.8125 | 15.97 |
| 44848.822916666664 | 16.92 |
| 44848.833333333336 | 18.23 |
| 44848.84375 | 17.86 |
| 44848.854166666664 | 20.1 |
| 44848.864583333336 | 19.7 |
| 44848.875 | 21.07 |
| 44848.885416666664 | 20.8 |
| 44848.895833333336 | 20.67 |
| 44848.90625 | 21.22 |
| 44848.916666666664 | 20.03 |
| 44848.927083333336 | 19.88 |
| 44848.9375 | 19.75 |
| 44848.947916666664 | 18.68 |
| 44848.958333333336 | 16.86 |
| 44848.96875 | 17.03 |
| 44848.979166666664 | 17 |
| 44848.989583333336 | 17.24 |
| 44849.0 | 17.24 |
| 44849.010416666664 | 16.46 |
| 44849.020833333336 | 16.46 |
| 44849.03125 | 15.93 |
| 44849.041666666664 | 15.67 |
| 44849.052083333336 | 15.49 |
| 44849.0625 | 14.86 |
| 44849.072916666664 | 14.01 |
| 44849.083333333336 | 15.37 |
| 44849.09375 | 14.79 |
| 44849.104166666664 | 15.24 |
| 44849.114583333336 | 14.91 |
| 44849.125 | 13.86 |
| 44849.135416666664 | 14.35 |
| 44849.145833333336 | 13.73 |
| 44849.15625 | 13.99 |
| 44849.166666666664 | 14.16 |
| 44849.177083333336 | 14.38 |
| 44849.1875 | 14.25 |
| 44849.197916666664 | 13.2 |
| 44849.208333333336 | 13.46 |
| 44849.21875 | 14.07 |
| 44849.229166666664 | 13.8 |
| 44849.239583333336 | 14.26 |
| 44849.25 | 13.41 |
| 44849.260416666664 | 11.77 |
| 44849.270833333336 | 14.51 |
| 44849.28125 | 14.5 |
| 44849.291666666664 | 15.44 |
| 44849.302083333336 | 18.44 |
| 44849.3125 | 16.1 |
| 44849.322916666664 | 15.96 |
| 44849.333333333336 | 16.64 |
| 44849.34375 | 16.21 |
| 44849.354166666664 | 17.92 |
| 44849.364583333336 | 17.35 |
| 44849.375 | 16.83 |
| 44849.385416666664 | 16.36 |
| 44849.395833333336 | 17.9 |
| 44849.40625 | 17.68 |
| 44849.416666666664 | 17.91 |
| 44849.427083333336 | 17.76 |
| 44849.4375 | 18.52 |
| 44849.447916666664 | 18.07 |
| 44849.458333333336 | 14.5 |
| 44849.46875 | 17.68 |
| 44849.479166666664 | 17.14 |
| 44849.489583333336 | 18.86 |
| 44849.5 | 18.89 |
| 44849.510416666664 | 18.39 |
| 44849.520833333336 | 18.06 |
| 44849.53125 | 17.95 |
| 44849.541666666664 | 16.76 |
| 44849.552083333336 | 16.47 |
| 44849.5625 | 16.33 |
| 44849.572916666664 | 16.12 |
| 44849.583333333336 | 15.95 |
| 44849.59375 | 15.92 |
| 44849.604166666664 | 16.12 |
| 44849.614583333336 | 15.47 |
| 44849.625 | 15.4 |
| 44849.635416666664 | 16.11 |
| 44849.645833333336 | 16.42 |
| 44849.65625 | 15.19 |
| 44849.666666666664 | 13.82 |
| 44849.677083333336 | 12.37 |
| 44849.6875 | 11.55 |
| 44849.697916666664 | 11.38 |
| 44849.708333333336 | 10.54 |
| 44849.71875 | 10.82 |
| 44849.729166666664 | 10.48 |
| 44849.739583333336 | 10.18 |
| 44849.75 | 10.33 |
| 44849.760416666664 | 10.81 |
| 44849.770833333336 | 12.48 |
| 44849.78125 | 15.45 |
| 44849.791666666664 | 16.95 |
| 44849.802083333336 | 17.77 |
| 44849.8125 | 18.97 |
| 44849.822916666664 | 18.5 |
| 44849.833333333336 | 19.8 |
| 44849.84375 | 19.78 |
| 44849.854166666664 | 20.16 |
| 44849.864583333336 | 20.22 |
| 44849.875 | 20.65 |
| 44849.885416666664 | 20.84 |
| 44849.895833333336 | 21.81 |
| 44849.90625 | 18.63 |
| 44849.916666666664 | 18.38 |
| 44849.927083333336 | 18.84 |
| 44849.9375 | 18.87 |
| 44849.947916666664 | 18.44 |
| 44849.958333333336 | 17.45 |
| 44849.96875 | 17.05 |
| 44849.979166666664 | 16.64 |
| 44849.989583333336 | 16.58 |
| 44850.0 | 15.99 |
| 44850.010416666664 | 16.27 |
| 44850.020833333336 | 16.74 |
| 44850.03125 | 16.79 |
| 44850.041666666664 | 16.71 |
| 44850.052083333336 | 16.91 |
| 44850.0625 | 16.47 |
| 44850.072916666664 | 16.92 |
| 44850.083333333336 | 17.47 |
| 44850.09375 | 17.81 |
| 44850.104166666664 | 17.12 |
| 44850.114583333336 | 17.31 |
| 44850.125 | 17.16 |
| 44850.135416666664 | 17.45 |
| 44850.145833333336 | 18.06 |
| 44850.15625 | 17.27 |
| 44850.166666666664 | 16.59 |
| 44850.177083333336 | 16.72 |
| 44850.1875 | 17.4 |
| 44850.197916666664 | 17.26 |
| 44850.208333333336 | 17.26 |
| 44850.21875 | 16.94 |
| 44850.229166666664 | 16.81 |
| 44850.239583333336 | 17.45 |
| 44850.25 | 17.88 |
| 44850.260416666664 | 18.23 |
| 44850.270833333336 | 19.39 |
| 44850.28125 | 18.22 |
| 44850.291666666664 | 18.62 |
| 44850.302083333336 | 18.26 |
| 44850.3125 | 17.43 |
| 44850.322916666664 | 17.12 |
| 44850.333333333336 | 17.29 |
| 44850.34375 | 17.19 |
| 44850.354166666664 | 17.88 |
| 44850.364583333336 | 18.22 |
| 44850.375 | 19.37 |
| 44850.385416666664 | 18.89 |
| 44850.395833333336 | 19.55 |
| 44850.40625 | 18.71 |
| 44850.416666666664 | 18.65 |
| 44850.427083333336 | 19.05 |
| 44850.4375 | 19.21 |
| 44850.447916666664 | 18.02 |
| 44850.458333333336 | 19.58 |
| 44850.46875 | 19.94 |
| 44850.479166666664 | 19.38 |
| 44850.489583333336 | 19.26 |
| 44850.5 | 19.76 |
| 44850.510416666664 | 17.49 |
| 44850.520833333336 | 18.52 |
| 44850.53125 | 19.14 |
| 44850.541666666664 | 20.63 |
| 44850.552083333336 | 19.13 |
| 44850.5625 | 19.28 |
| 44850.572916666664 | 19.57 |
| 44850.583333333336 | 19.32 |
| 44850.59375 | 19.11 |
| 44850.604166666664 | 18.6 |
| 44850.614583333336 | 18.34 |
| 44850.625 | 18.94 |
| 44850.635416666664 | 17.47 |
| 44850.645833333336 | 18.17 |
| 44850.65625 | 17.95 |
| 44850.666666666664 | 16.65 |
| 44850.677083333336 | 16.22 |
| 44850.6875 | 15.75 |
| 44850.697916666664 | 16.16 |
| 44850.708333333336 | 16.03 |
| 44850.71875 | 16.69 |
| 44850.729166666664 | 16.38 |
| 44850.739583333336 | 16.66 |
| 44850.75 | 15.43 |
| 44850.760416666664 | 15.84 |
| 44850.770833333336 | 17.08 |
| 44850.78125 | 14.02 |
| 44850.791666666664 | 14.55 |
| 44850.802083333336 | 14.63 |
| 44850.8125 | 16.77 |
| 44850.822916666664 | 17.48 |
| 44850.833333333336 | 18.45 |
| 44850.84375 | 18.54 |
| 44850.854166666664 | 16.17 |
| 44850.864583333336 | 16.56 |
| 44850.875 | 15.96 |
| 44850.885416666664 | 17.22 |
| 44850.895833333336 | 18.45 |
| 44850.90625 | 17.63 |
| 44850.916666666664 | 17.9 |
| 44850.927083333336 | 17.84 |
| 44850.9375 | 17.53 |
| 44850.947916666664 | 18.27 |
| 44850.958333333336 | 18.59 |
| 44850.96875 | 18.81 |
| 44850.979166666664 | 19.53 |
| 44850.989583333336 | 17.61 |
| 44851.0 | 17.87 |
| 44851.010416666664 | 17.05 |
| 44851.020833333336 | 16.32 |
| 44851.03125 | 16.43 |
| 44851.041666666664 | 15.85 |
| 44851.052083333336 | 14.83 |
| 44851.0625 | 15.18 |
| 44851.072916666664 | 15.7 |
| 44851.083333333336 | 16.03 |
| 44851.09375 | 16.26 |
| 44851.104166666664 | 15.98 |
| 44851.114583333336 | 16.03 |
| 44851.125 | 16.21 |
| 44851.135416666664 | 15.98 |
| 44851.145833333336 | 16.2 |
| 44851.15625 | 16.13 |
| 44851.166666666664 | 15.72 |
| 44851.177083333336 | 16.52 |
| 44851.1875 | 16.17 |
| 44851.197916666664 | 16.01 |
| 44851.208333333336 | 16.31 |
| 44851.21875 | 15.18 |
| 44851.229166666664 | 13.79 |
| 44851.239583333336 | 15.05 |
| 44851.25 | 14.86 |
| 44851.260416666664 | 14.47 |
| 44851.270833333336 | 13.89 |
| 44851.28125 | 15.49 |
| 44851.291666666664 | 16.02 |
| 44851.302083333336 | 16.56 |
| 44851.3125 | 18.52 |
| 44851.322916666664 | 19.77 |
| 44851.333333333336 | 22.24 |
| 44851.34375 | 19 |
| 44851.354166666664 | 17.48 |
| 44851.364583333336 | 18.78 |
| 44851.375 | 19.09 |
| 44851.385416666664 | 19.36 |
| 44851.395833333336 | 20.74 |
| 44851.40625 | 21.54 |
| 44851.416666666664 | 21.11 |
| 44851.427083333336 | 21.49 |
| 44851.4375 | 21.54 |
| 44851.447916666664 | 21.34 |
| 44851.458333333336 | 21.22 |
| 44851.46875 | 20.48 |
| 44851.479166666664 | 21.84 |
| 44851.489583333336 | 18.79 |
| 44851.5 | 16.27 |
| 44851.510416666664 | 16.09 |
| 44851.520833333336 | 17.36 |
| 44851.53125 | 18.57 |
| 44851.541666666664 | 17.65 |
| 44851.552083333336 | 17.91 |
| 44851.5625 | 19.14 |
| 44851.572916666664 | 17.61 |
| 44851.583333333336 | 16.86 |
| 44851.59375 | 17.01 |
| 44851.604166666664 | 17.36 |
| 44851.614583333336 | 16.62 |
| 44851.625 | 18.41 |
| 44851.635416666664 | 17.36 |
| 44851.645833333336 | 16.51 |
| 44851.65625 | 15.34 |
| 44851.666666666664 | 14.88 |
| 44851.677083333336 | 15.63 |
| 44851.6875 | 15.36 |
| 44851.697916666664 | 15.65 |
| 44851.708333333336 | 14.75 |
| 44851.71875 | 14.77 |
| 44851.729166666664 | 14.45 |
| 44851.739583333336 | 14.51 |
| 44851.75 | 13.54 |
| 44851.760416666664 | 13.44 |
| 44851.770833333336 | 12.93 |
| 44851.78125 | 12.86 |
| 44851.791666666664 | 11.97 |
| 44851.802083333336 | 13.69 |
| 44851.8125 | 12.77 |
| 44851.822916666664 | 13.63 |
| 44851.833333333336 | 15.59 |
| 44851.84375 | 13.22 |
| 44851.854166666664 | 15.76 |
| 44851.864583333336 | 15.69 |
| 44851.875 | 16.3 |
| 44851.885416666664 | 17.79 |
| 44851.895833333336 | 17.66 |
| 44851.90625 | 20.23 |
| 44851.916666666664 | 20.4 |
| 44851.927083333336 | 21.42 |
| 44851.9375 | 20.65 |
| 44851.947916666664 | 18.5 |
| 44851.958333333336 | 18.2 |
| 44851.96875 | 17.44 |
| 44851.979166666664 | 18.19 |
| 44851.989583333336 | 18.13 |
| 44852.0 | 18.74 |
| 44852.010416666664 | 19.39 |
| 44852.020833333336 | 19.13 |
| 44852.03125 | 19.22 |
| 44852.041666666664 | 19.46 |
| 44852.052083333336 | 19.69 |
| 44852.0625 | 19.78 |
| 44852.072916666664 | 19.29 |
| 44852.083333333336 | 19.31 |
| 44852.09375 | 19.14 |
| 44852.104166666664 | 19.46 |
| 44852.114583333336 | 20.17 |
| 44852.125 | 20.88 |
| 44852.135416666664 | 31.86 |
| 44852.145833333336 | 19.28 |
| 44852.15625 | 19.01 |
| 44852.166666666664 | 19.06 |
| 44852.177083333336 | 17.96 |
| 44852.1875 | 17.7 |
| 44852.197916666664 | 17.59 |
| 44852.208333333336 | 17.86 |
| 44852.21875 | 17.61 |
| 44852.229166666664 | 17.89 |
| 44852.239583333336 | 17.86 |
| 44852.25 | 17.68 |
| 44852.260416666664 | 17.82 |
| 44852.270833333336 | 17.72 |
| 44852.28125 | 17.28 |
| 44852.291666666664 | 17.47 |
| 44852.302083333336 | 17.08 |
| 44852.3125 | 17.52 |
| 44852.322916666664 | 17.44 |
| 44852.333333333336 | 17.25 |
| 44852.34375 | 17.19 |
| 44852.354166666664 | 18.38 |
| 44852.364583333336 | 9.09 |
| 44852.375 | 9.13 |
| 44852.385416666664 | 9.69 |
| 44852.395833333336 | 10.95 |
| 44852.40625 | 10.32 |
| 44852.416666666664 | 11.03 |
| 44852.427083333336 | 11.52 |
| 44852.4375 | 13.04 |
| 44852.447916666664 | 13.21 |
| 44852.458333333336 | 26.45 |
| 44852.46875 | 15.9 |
| 44852.479166666664 | 13.77 |
| 44852.489583333336 | 13.33 |
| 44852.5 | 12.68 |
| 44852.510416666664 | 12.68 |
| 44852.520833333336 | 13.71 |
| 44852.53125 | 13.47 |
| 44852.541666666664 | 13.7 |
| 44852.552083333336 | 13.75 |
| 44852.5625 | 14.85 |
| 44852.572916666664 | 13.31 |
| 44852.583333333336 | 13.35 |
| 44852.59375 | 14.23 |
| 44852.604166666664 | 14.62 |
| 44852.614583333336 | 15.01 |
| 44852.625 | 14.86 |
| 44852.635416666664 | 15.79 |
| 44852.645833333336 | 13.03 |
| 44852.65625 | 12.54 |
| 44852.666666666664 | 12.49 |
| 44852.677083333336 | 12.11 |
| 44852.6875 | 12.14 |
| 44852.697916666664 | 12.2 |
| 44852.708333333336 | 11.49 |
| 44852.71875 | 11.36 |
| 44852.729166666664 | 11.39 |
| 44852.739583333336 | 11.17 |
| 44852.75 | 11.17 |
| 44852.760416666664 | 10.59 |
| 44852.770833333336 | 10.09 |
| 44852.78125 | 10.4 |
| 44852.791666666664 | 10.71 |
| 44852.802083333336 | 10.4 |
| 44852.8125 | 10.34 |
| 44852.822916666664 | 9.47 |
| 44852.833333333336 | 8.77 |
| 44852.84375 | 9.16 |
| 44852.854166666664 | 9.94 |
| 44852.864583333336 | 9.08 |
| 44852.875 | 9.2 |
| 44852.885416666664 | 8.97 |
| 44852.895833333336 | 10.83 |
| 44852.90625 | 10.94 |
| 44852.916666666664 | 15.74 |
| 44852.927083333336 | 12.27 |
| 44852.9375 | 12.66 |
| 44852.947916666664 | 13.35 |
| 44852.958333333336 | 13.91 |
| 44852.96875 | 13.48 |
| 44852.979166666664 | 13.99 |
| 44852.989583333336 | 14.37 |
| 44853.0 | 15.19 |
| 44853.010416666664 | 15.19 |
| 44853.020833333336 | 15.18 |
| 44853.03125 | 15.36 |
| 44853.041666666664 | 14.85 |
| 44853.052083333336 | 13.93 |
| 44853.0625 | 13.92 |
| 44853.072916666664 | 13.94 |
| 44853.083333333336 | 14.48 |
| 44853.09375 | 14.24 |
| 44853.104166666664 | 13.57 |
| 44853.114583333336 | 13.59 |
| 44853.125 | 13 |
| 44853.135416666664 | 13.94 |
| 44853.145833333336 | 13.94 |
| 44853.15625 | 15.11 |
| 44853.166666666664 | 15.48 |
| 44853.177083333336 | 14.87 |
| 44853.1875 | 17.26 |
| 44853.197916666664 | 14.18 |
| 44853.208333333336 | 13.91 |
| 44853.21875 | 14.37 |
| 44853.229166666664 | 13.6 |
| 44853.239583333336 | 13.22 |
| 44853.25 | 12.49 |
| 44853.260416666664 | 12.43 |
| 44853.270833333336 | 12.74 |
| 44853.28125 | 12.72 |
| 44853.291666666664 | 12.83 |
| 44853.302083333336 | 12.48 |
| 44853.3125 | 12.91 |
| 44853.322916666664 | 12.94 |
| 44853.333333333336 | 13.07 |
| 44853.34375 | 12.41 |
| 44853.354166666664 | 14.02 |
| 44853.364583333336 | 12.5 |
| 44853.375 | 13.37 |
| 44853.385416666664 | 13.47 |
| 44853.395833333336 | 13.15 |
| 44853.40625 | 13.03 |
| 44853.416666666664 | 11.36 |
| 44853.427083333336 | 10.94 |
| 44853.4375 | 12.24 |
| 44853.447916666664 | 14.07 |
| 44853.458333333336 | 12.74 |
| 44853.46875 | 13.75 |
| 44853.479166666664 | 14.47 |
| 44853.489583333336 | 14.53 |
| 44853.5 | 14.5 |
| 44853.510416666664 | 14.67 |
| 44853.520833333336 | 15.36 |
| 44853.53125 | 15.33 |
| 44853.541666666664 | 15.12 |
| 44853.552083333336 | 15.47 |
| 44853.5625 | 15.6 |
| 44853.572916666664 | 15.9 |
| 44853.583333333336 | 16.73 |
| 44853.59375 | 16.89 |
| 44853.604166666664 | 15.62 |
| 44853.614583333336 | 15.24 |
| 44853.625 | 15.1 |
| 44853.635416666664 | 14.76 |
| 44853.645833333336 | 15.84 |
| 44853.65625 | 16.08 |
| 44853.666666666664 | 15.46 |
| 44853.677083333336 | 15.8 |
| 44853.6875 | 16.51 |
| 44853.697916666664 | 16.33 |
| 44853.708333333336 | 14.71 |
| 44853.71875 | 14.73 |
| 44853.729166666664 | 14.83 |
| 44853.739583333336 | 14.7 |
| 44853.75 | 14.96 |
| 44853.760416666664 | 14.85 |
| 44853.770833333336 | 14.83 |
| 44853.78125 | 14.97 |
| 44853.791666666664 | 14.89 |
| 44853.802083333336 | 15.76 |
| 44853.8125 | 14.71 |
| 44853.822916666664 | 15.2 |
| 44853.833333333336 | 14.66 |
| 44853.84375 | 13.1 |
| 44853.854166666664 | 12.71 |
| 44853.864583333336 | 12.49 |
| 44853.875 | 12.66 |
| 44853.885416666664 | 11.14 |
| 44853.895833333336 | 10.17 |
| 44853.90625 | 10.75 |
| 44853.916666666664 | 10.25 |
| 44853.927083333336 | 11.46 |
| 44853.9375 | 12.25 |
| 44853.947916666664 | 12.77 |
| 44853.958333333336 | 13.17 |
| 44853.96875 | 14.98 |
| 44853.979166666664 | 15.51 |
| 44853.989583333336 | 15.95 |
| 44854.0 | 15.72 |
| 44854.010416666664 | 16.95 |
| 44854.020833333336 | 16.85 |
| 44854.03125 | 17.2 |
| 44854.041666666664 | 16.07 |
| 44854.052083333336 | 15.32 |
| 44854.0625 | 15.4 |
| 44854.072916666664 | 15.53 |
| 44854.083333333336 | 15.45 |
| 44854.09375 | 15.47 |
| 44854.104166666664 | 15.86 |
| 44854.114583333336 | 16.52 |
| 44854.125 | 16.81 |
| 44854.135416666664 | 16.87 |
| 44854.145833333336 | 16.66 |
| 44854.15625 | 15.16 |
| 44854.166666666664 | 14.73 |
| 44854.177083333336 | 14.91 |
| 44854.1875 | 15.96 |
| 44854.197916666664 | 16.12 |
| 44854.208333333336 | 16.53 |
| 44854.21875 | 16.42 |
| 44854.229166666664 | 16.42 |
| 44854.239583333336 | 16.39 |
| 44854.25 | 16.32 |
| 44854.260416666664 | 16.34 |
| 44854.270833333336 | 16.32 |
| 44854.28125 | 16.42 |
| 44854.291666666664 | 16.29 |
| 44854.302083333336 | 16.17 |
| 44854.3125 | 16.33 |
| 44854.322916666664 | 16.54 |
| 44854.333333333336 | 16.65 |
| 44854.34375 | 16.69 |
| 44854.354166666664 | 16.91 |
| 44854.364583333336 | 16.87 |
| 44854.375 | 16.67 |
| 44854.385416666664 | 17.41 |
| 44854.395833333336 | 15.52 |
| 44854.40625 | 14.43 |
| 44854.416666666664 | 14.54 |
| 44854.427083333336 | 14.5 |
| 44854.4375 | 15.13 |
| 44854.447916666664 | 15.7 |
| 44854.458333333336 | 15.48 |
| 44854.46875 | 16.1 |
| 44854.479166666664 | 16.44 |
| 44854.489583333336 | 15.23 |
| 44854.5 | 15.39 |
| 44854.510416666664 | 16.52 |
| 44854.520833333336 | 16.16 |
| 44854.53125 | 16.28 |
| 44854.541666666664 | 15.29 |
| 44854.552083333336 | 15.05 |
| 44854.5625 | 24.28 |
| 44854.572916666664 | 14.41 |
| 44854.583333333336 | 15.58 |
| 44854.59375 | 14.19 |
| 44854.604166666664 | 14.09 |
| 44854.614583333336 | 14.21 |
| 44854.625 | 15.33 |
| 44854.635416666664 | 14.46 |
| 44854.645833333336 | 13.73 |
| 44854.65625 | 14.7 |
| 44854.666666666664 | 15.48 |
| 44854.677083333336 | 16.38 |
| 44854.6875 | 16.44 |
| 44854.697916666664 | 15.47 |
| 44854.708333333336 | 15.46 |
| 44854.71875 | 15.35 |
| 44854.729166666664 | 15.46 |
| 44854.739583333336 | 14.04 |
| 44854.75 | 14.16 |
| 44854.760416666664 | 14.62 |
| 44854.770833333336 | 14.34 |
| 44854.78125 | 13.36 |
| 44854.791666666664 | 13.58 |
| 44854.802083333336 | 14.3 |
| 44854.8125 | 13.92 |
| 44854.822916666664 | 12.14 |
| 44854.833333333336 | 11.07 |
| 44854.84375 | 10.99 |
| 44854.854166666664 | 11.91 |
| 44854.864583333336 | 11.3 |
| 44854.875 | 11.42 |
| 44854.885416666664 | 11.52 |
| 44854.895833333336 | 11.77 |
| 44854.90625 | 12.33 |
| 44854.916666666664 | 12.38 |
| 44854.927083333336 | 12.15 |
| 44854.9375 | 12.83 |
| 44854.947916666664 | 12.97 |
| 44854.958333333336 | 12.61 |
| 44854.96875 | 12.19 |
| 44854.979166666664 | 13.15 |
| 44854.989583333336 | 14.12 |
| 44855.0 | 15.42 |
| 44855.010416666664 | 15.85 |
| 44855.020833333336 | 15.65 |
| 44855.03125 | 15.89 |
| 44855.041666666664 | 17.1 |
| 44855.052083333336 | 17.06 |
| 44855.0625 | 17.4 |
| 44855.072916666664 | 16.28 |
| 44855.083333333336 | 15.89 |
| 44855.09375 | 16.6 |
| 44855.104166666664 | 16.27 |
| 44855.114583333336 | 14.86 |
| 44855.125 | 14.55 |
| 44855.135416666664 | 14.2 |
| 44855.145833333336 | 14.59 |
| 44855.15625 | 15.13 |
| 44855.166666666664 | 14.62 |
| 44855.177083333336 | 14.51 |
| 44855.1875 | 13.18 |
| 44855.197916666664 | 13.98 |
| 44855.208333333336 | 14.27 |
| 44855.21875 | 14.1 |
| 44855.229166666664 | 14.81 |
| 44855.239583333336 | 15.12 |
| 44855.25 | 15.33 |
| 44855.260416666664 | 15.07 |
| 44855.270833333336 | 15.37 |
| 44855.28125 | 15.65 |
| 44855.291666666664 | 15.42 |
| 44855.302083333336 | 15.55 |
| 44855.3125 | 15.02 |
| 44855.322916666664 | 15.3 |
| 44855.333333333336 | 15.34 |
| 44855.34375 | 15.1 |
| 44855.354166666664 | 434.65 |
| 44855.364583333336 | 15.21 |
| 44855.375 | 33.67 |
| 44855.385416666664 | 26.94 |
| 44855.395833333336 | 20.06 |
| 44855.40625 | 13.36 |
| 44855.416666666664 | 13.48 |
| 44855.427083333336 | 11.86 |
| 44855.4375 | 13.67 |
| 44855.447916666664 | 14.41 |
| 44855.458333333336 | 13.47 |
| 44855.46875 | 13.81 |
| 44855.479166666664 | 18.27 |
| 44855.489583333336 | 15.16 |
| 44855.5 | 15.54 |
| 44855.510416666664 | 15.44 |
| 44855.520833333336 | 15.76 |
| 44855.53125 | 16.73 |
| 44855.541666666664 | 16.79 |
| 44855.552083333336 | 16.35 |
| 44855.5625 | 16.73 |
| 44855.572916666664 | 16.88 |
| 44855.583333333336 | 17.13 |
| 44855.59375 | 17.47 |
| 44855.604166666664 | 17.78 |
| 44855.614583333336 | 17.96 |
| 44855.625 | 18.13 |
| 44855.635416666664 | 18.19 |
| 44855.645833333336 | 15.28 |
| 44855.65625 | 15.76 |
| 44855.666666666664 | 16.2 |
| 44855.677083333336 | 15.92 |
| 44855.6875 | 15.42 |
| 44855.697916666664 | 15.59 |
| 44855.708333333336 | 16.79 |
| 44855.71875 | 16.88 |
| 44855.729166666664 | 17.36 |
| 44855.739583333336 | 17.41 |
| 44855.75 | 17.29 |
| 44855.760416666664 | 18.41 |
| 44855.770833333336 | 19.27 |
| 44855.78125 | 20.06 |
| 44855.791666666664 | 19.08 |
| 44855.802083333336 | 18.71 |
| 44855.8125 | 19.02 |
| 44855.822916666664 | 18.61 |
| 44855.833333333336 | 18.21 |
| 44855.84375 | 16.61 |
| 44855.854166666664 | 146.68 |
| 44855.864583333336 | 16.87 |
| 44855.875 | 17.4 |
| 44855.885416666664 | 17.64 |
| 44855.895833333336 | 18.52 |
| 44855.90625 | 18.83 |
| 44855.916666666664 | 18.71 |
| 44855.927083333336 | 19.12 |
| 44855.9375 | 18.95 |
| 44855.947916666664 | 16.65 |
| 44855.958333333336 | 15.62 |
| 44855.96875 | 15.15 |
| 44855.979166666664 | 15.84 |
| 44855.989583333336 | 15.56 |
| 44856.0 | 15.85 |
| 44856.010416666664 | 16.5 |
| 44856.020833333336 | 17.1 |
| 44856.03125 | 18.78 |
| 44856.041666666664 | 19.76 |
| 44856.052083333336 | 19.11 |
| 44856.0625 | 21.03 |
| 44856.072916666664 | 22.52 |
| 44856.083333333336 | 22.28 |
| 44856.09375 | 23.45 |
| 44856.104166666664 | 23.02 |
| 44856.114583333336 | 20.66 |
| 44856.125 | 20.4 |
| 44856.135416666664 | 20.73 |
| 44856.145833333336 | 20.39 |
| 44856.15625 | 18.89 |
| 44856.166666666664 | 19.37 |
| 44856.177083333336 | 20.25 |
| 44856.1875 | 19.62 |
| 44856.197916666664 | 19.17 |
| 44856.208333333336 | 17.62 |
| 44856.21875 | 18.59 |
| 44856.229166666664 | 19.06 |
| 44856.239583333336 | 19.19 |
| 44856.25 | 19.76 |
| 44856.260416666664 | 19.44 |
| 44856.270833333336 | 19.51 |
| 44856.28125 | 19.39 |
| 44856.291666666664 | 18.89 |
| 44856.302083333336 | 19.09 |
| 44856.3125 | 18.58 |
| 44856.322916666664 | 18.63 |
| 44856.333333333336 | 18.9 |
| 44856.34375 | 19.67 |
| 44856.354166666664 | 18.97 |
| 44856.364583333336 | 18.93 |
| 44856.375 | 19.41 |
| 44856.385416666664 | 19.55 |
| 44856.395833333336 | 19.89 |
| 44856.40625 | 20.04 |
| 44856.416666666664 | 20.44 |
| 44856.427083333336 | 20.19 |
| 44856.4375 | 20.33 |
| 44856.447916666664 | 20.37 |
| 44856.458333333336 | 20.24 |
| 44856.46875 | 21.64 |
| 44856.479166666664 | 17.82 |
| 44856.489583333336 | 17.85 |
| 44856.5 | 17.9 |
| 44856.510416666664 | 18.9 |
| 44856.520833333336 | 19.24 |
| 44856.53125 | 19.25 |
| 44856.541666666664 | 20.61 |
| 44856.552083333336 | 21.18 |
| 44856.5625 | 23.09 |
| 44856.572916666664 | 20.55 |
| 44856.583333333336 | 22.45 |
| 44856.59375 | 21.97 |
| 44856.604166666664 | 23.63 |
| 44856.614583333336 | 24.32 |
| 44856.625 | 24.26 |
| 44856.635416666664 | 23.27 |
| 44856.645833333336 | 23.09 |
| 44856.65625 | 23.1 |
| 44856.666666666664 | 22.47 |
| 44856.677083333336 | 21.43 |
| 44856.6875 | 22.74 |
| 44856.697916666664 | 22.11 |
| 44856.708333333336 | 22.41 |
| 44856.71875 | 21.42 |
| 44856.729166666664 | 21.79 |
| 44856.739583333336 | 26.95 |
| 44856.75 | 22.21 |
| 44856.760416666664 | 22.22 |
| 44856.770833333336 | 20.78 |
| 44856.78125 | 20.77 |
| 44856.791666666664 | 21.02 |
| 44856.802083333336 | 20.96 |
| 44856.8125 | 20.4 |
| 44856.822916666664 | 20.97 |
| 44856.833333333336 | 20.56 |
| 44856.84375 | 20.22 |
| 44856.854166666664 | 20.02 |
| 44856.864583333336 | 20.46 |
| 44856.875 | 21.15 |
| 44856.885416666664 | 21.4 |
| 44856.895833333336 | 21.83 |
| 44856.90625 | 21.6 |
| 44856.916666666664 | 22.07 |
| 44856.927083333336 | 22.41 |
| 44856.9375 | 22.61 |
| 44856.947916666664 | 23.18 |
| 44856.958333333336 | 22.51 |
| 44856.96875 | 22.66 |
| 44856.979166666664 | 18.05 |
| 44856.989583333336 | 18.7 |
| 44857.0 | 18.98 |
| 44857.010416666664 | 19.5 |
| 44857.020833333336 | 20.23 |
| 44857.03125 | 20.79 |
| 44857.041666666664 | 21.51 |
| 44857.052083333336 | 20.92 |
| 44857.0625 | 21.86 |
| 44857.072916666664 | 23.3 |
| 44857.083333333336 | 23.81 |
| 44857.09375 | 24.99 |
| 44857.104166666664 | 26.02 |
| 44857.114583333336 | 27.13 |
| 44857.125 | 25.6 |
| 44857.135416666664 | 26.32 |
| 44857.145833333336 | 26.3 |
| 44857.15625 | 24.6 |
| 44857.166666666664 | 24.36 |
| 44857.177083333336 | 24.71 |
| 44857.1875 | 24.86 |
| 44857.197916666664 | 25.93 |
| 44857.208333333336 | 27.41 |
| 44857.21875 | 28.2 |
| 44857.229166666664 | 27.69 |
| 44857.239583333336 | 27.97 |
| 44857.25 | 28.65 |
| 44857.260416666664 | 27.01 |
| 44857.270833333336 | 27.69 |
| 44857.28125 | 27.71 |
| 44857.291666666664 | 27.29 |
| 44857.302083333336 | 27.76 |
| 44857.3125 | 26.83 |
| 44857.322916666664 | 26.47 |
| 44857.333333333336 | 27.14 |
| 44857.34375 | 24.03 |
| 44857.354166666664 | 24.49 |
| 44857.364583333336 | 24.97 |
| 44857.375 | 25.79 |
| 44857.385416666664 | 26.86 |
| 44857.395833333336 | 25.52 |
| 44857.40625 | 25.3 |
| 44857.416666666664 | 26.46 |
| 44857.427083333336 | 26.86 |
| 44857.4375 | 26.78 |
| 44857.447916666664 | 26.69 |
| 44857.458333333336 | 25.16 |
| 44857.46875 | 25.13 |
| 44857.479166666664 | 26.5 |
| 44857.489583333336 | 26.26 |
| 44857.5 | 26.53 |
| 44857.510416666664 | 26.66 |
| 44857.520833333336 | 26.49 |
| 44857.53125 | 26.63 |
| 44857.541666666664 | 26.62 |
| 44857.552083333336 | 37.7 |
| 44857.5625 | 19.86 |
| 44857.572916666664 | 20.84 |
| 44857.583333333336 | 21.5 |
| 44857.59375 | 21.96 |
| 44857.604166666664 | 22.83 |
| 44857.614583333336 | 23.35 |
| 44857.625 | 23.63 |
| 44857.635416666664 | 23.77 |
| 44857.645833333336 | 25.81 |
| 44857.65625 | 26.22 |
| 44857.666666666664 | 27.07 |
| 44857.677083333336 | 28.98 |
| 44857.6875 | 26.86 |
| 44857.697916666664 | 29.33 |
| 44857.708333333336 | 30.2 |
| 44857.71875 | 31.35 |
| 44857.729166666664 | 30.43 |
| 44857.739583333336 | 30.4 |
| 44857.75 | 30.54 |
| 44857.760416666664 | 30.03 |
| 44857.770833333336 | 27.81 |
| 44857.78125 | 26.77 |
| 44857.791666666664 | 27.5 |
| 44857.802083333336 | 27.57 |
| 44857.8125 | 27.53 |
| 44857.822916666664 | 27.21 |
| 44857.833333333336 | 27.62 |
| 44857.84375 | 21.88 |
| 44857.854166666664 | 21.93 |
| 44857.864583333336 | 22.06 |
| 44857.875 | 22.3 |
| 44857.885416666664 | 22.66 |
| 44857.895833333336 | 22.74 |
| 44857.90625 | 23.12 |
| 44857.916666666664 | 23.46 |
| 44857.927083333336 | 23.56 |
| 44857.9375 | 23.84 |
| 44857.947916666664 | 24.18 |
| 44857.958333333336 | 24.42 |
| 44857.96875 | 24.81 |
| 44857.979166666664 | 23.78 |
| 44857.989583333336 | 24.18 |
| 44858.0 | 22.67 |
| 44858.010416666664 | 23.09 |
| 44858.020833333336 | 23.18 |
| 44858.03125 | 23.42 |
| 44858.041666666664 | 24.26 |
| 44858.052083333336 | 25.03 |
| 44858.0625 | 25.58 |
| 44858.072916666664 | 24.68 |
| 44858.083333333336 | 25.09 |
| 44858.09375 | 25.7 |
| 44858.104166666664 | 25.65 |
| 44858.114583333336 | 25.59 |
| 44858.125 | 27 |
| 44858.135416666664 | 26.31 |
| 44858.145833333336 | 27.76 |
| 44858.15625 | 27.47 |
| 44858.166666666664 | 27.6 |
| 44858.177083333336 | 29.79 |
| 44858.1875 | 30.73 |
| 44858.197916666664 | 31.77 |
| 44858.208333333336 | 31.69 |
| 44858.21875 | 33.43 |
| 44858.229166666664 | 31.72 |
| 44858.239583333336 | 34.56 |
| 44858.25 | 32 |
| 44858.260416666664 | 31.31 |
| 44858.270833333336 | 31.19 |
| 44858.28125 | 26.53 |
| 44858.291666666664 | 27.76 |
| 44858.302083333336 | 33.74 |
| 44858.3125 | 36.45 |
| 44858.322916666664 | 27.87 |
| 44858.333333333336 | 32.88 |
| 44858.34375 | 28.2 |
| 44858.354166666664 | 27.2 |
| 44858.364583333336 | 27.63 |
| 44858.375 | 25.96 |
| 44858.385416666664 | 26.25 |
| 44858.395833333336 | 26.58 |
| 44858.40625 | 27.32 |
| 44858.416666666664 | 28.22 |
| 44858.427083333336 | 28.43 |
| 44858.4375 | 28.88 |
| 44858.447916666664 | 29.68 |
| 44858.458333333336 | 28.58 |
| 44858.46875 | 28.69 |
| 44858.479166666664 | 28.62 |
| 44858.489583333336 | 29.33 |
| 44858.5 | 29.46 |
| 44858.510416666664 | 29.75 |
| 44858.520833333336 | 29.27 |
| 44858.53125 | 28.1 |
| 44858.541666666664 | 27.98 |
| 44858.552083333336 | 28.46 |
| 44858.5625 | 28.46 |
| 44858.572916666664 | 28.46 |
| 44858.583333333336 | 25.96 |
| 44858.59375 | 34.42 |
| 44858.604166666664 | 26.08 |
| 44858.614583333336 | 25.95 |
| 44858.625 | 25.88 |
| 44858.635416666664 | 27.12 |
| 44858.645833333336 | 29.38 |
| 44858.65625 | 27.73 |
| 44858.666666666664 | 28.22 |
| 44858.677083333336 | 29 |
| 44858.6875 | 30.9 |
| 44858.697916666664 | 31.52 |
| 44858.708333333336 | 32.21 |
| 44858.71875 | 33.22 |
| 44858.729166666664 | 31.38 |
| 44858.739583333336 | 31.46 |
| 44858.75 | 31.84 |
| 44858.760416666664 | 29.93 |
| 44858.770833333336 | 29.19 |
| 44858.78125 | 30.27 |
| 44858.791666666664 | 31.58 |
| 44858.802083333336 | 29.97 |
| 44858.8125 | 28.57 |
| 44858.822916666664 | 27.79 |
| 44858.833333333336 | 26.45 |
| 44858.84375 | 26.6 |
| 44858.854166666664 | 27.18 |
| 44858.864583333336 | 27.14 |
| 44858.875 | 25.45 |
| 44858.885416666664 | 25.57 |
| 44858.895833333336 | 24.87 |
| 44858.90625 | 24.99 |
| 44858.916666666664 | 25.21 |
| 44858.927083333336 | 25.49 |
| 44858.9375 | 25.87 |
| 44858.947916666664 | 26.49 |
| 44858.958333333336 | 26.14 |
| 44858.96875 | 26.31 |
| 44858.979166666664 | 26.14 |
| 44858.989583333336 | 27.5 |
| 44859.0 | 27.52 |
| 44859.010416666664 | 27.61 |
| 44859.020833333336 | 27.19 |
| 44859.03125 | 26.83 |
| 44859.041666666664 | 26.29 |
| 44859.052083333336 | 26.2 |
| 44859.0625 | 26.3 |
| 44859.072916666664 | 91.71 |
| 44859.083333333336 | 25.29 |
| 44859.09375 | 25.52 |
| 44859.104166666664 | 25.91 |
| 44859.114583333336 | 27 |
| 44859.125 | 26.49 |
| 44859.135416666664 | 41.42 |
| 44859.145833333336 | 32.08 |
| 44859.15625 | 22.52 |
| 44859.166666666664 | 54.47 |
| 44859.177083333336 | 57.05 |
| 44859.1875 | 15.56 |
| 44859.197916666664 | 23.29 |
| 44859.208333333336 | 379.78 |
| 44859.21875 | 16.4 |
| 44859.229166666664 | 17.21 |
| 44859.239583333336 | 14.53 |
| 44859.25 | 15.33 |
| 44859.260416666664 | 13.84 |
| 44859.270833333336 | 13.72 |
| 44859.28125 | 13.42 |
| 44859.291666666664 | 12.04 |
| 44859.302083333336 | 13.13 |
| 44859.3125 | 13.35 |
| 44859.322916666664 | 13.95 |
| 44859.333333333336 | 14.26 |
| 44859.34375 | 14.39 |
| 44859.354166666664 | 14.46 |
| 44859.364583333336 | 15 |
| 44859.375 | 14.67 |
| 44859.385416666664 | 14.65 |
| 44859.395833333336 | 14.33 |
| 44859.40625 | 15.08 |
| 44859.416666666664 | 15.58 |
| 44859.427083333336 | 15.02 |
| 44859.4375 | 14.59 |
| 44859.447916666664 | 16.87 |
| 44859.458333333336 | 14.72 |
| 44859.46875 | 12.74 |
| 44859.479166666664 | 12.38 |
| 44859.489583333336 | 12.52 |
| 44859.5 | 12.19 |
| 44859.510416666664 | 11.43 |
| 44859.520833333336 | 11.17 |
| 44859.53125 | 11.09 |
| 44859.541666666664 | 10.97 |
| 44859.552083333336 | 9.99 |
| 44859.5625 | 9.02 |
| 44859.572916666664 | 8.78 |
| 44859.583333333336 | 8.02 |
| 44859.59375 | 8.72 |
| 44859.604166666664 | 9.2 |
| 44859.614583333336 | 9.72 |
| 44859.625 | 10.4 |
| 44859.635416666664 | 12.22 |
| 44859.645833333336 | 12.78 |
| 44859.65625 | 15.96 |
| 44859.666666666664 | 14.05 |
| 44859.677083333336 | 16.96 |
| 44859.6875 | 17.48 |
| 44859.697916666664 | 18.37 |
| 44859.708333333336 | 20.13 |
| 44859.71875 | 280.19 |
| 44859.729166666664 | 21.35 |
| 44859.739583333336 | 20.56 |
| 44859.75 | 20.56 |
| 44859.760416666664 | 20.41 |
| 44859.770833333336 | 18.63 |
| 44859.78125 | 17.54 |
| 44859.791666666664 | 15.82 |
| 44859.802083333336 | 13.72 |
| 44859.8125 | 13.43 |
| 44859.822916666664 | 11.62 |
| 44859.833333333336 | 11.84 |
| 44859.84375 | 13.52 |
| 44859.854166666664 | 14.22 |
| 44859.864583333336 | 20.37 |
| 44859.875 | 13.14 |
| 44859.885416666664 | 12.86 |
| 44859.895833333336 | 13.63 |
| 44859.90625 | 13.14 |
| 44859.916666666664 | 13.79 |
| 44859.927083333336 | 13.32 |
| 44859.9375 | 12.91 |
| 44859.947916666664 | 12.12 |
| 44859.958333333336 | 15.67 |
| 44859.96875 | 17.2 |
| 44859.979166666664 | 12.57 |
| 44859.989583333336 | 10.48 |
| 44860.0 | 10.23 |
| 44860.010416666664 | 9.7 |
| 44860.020833333336 | 10.12 |
| 44860.03125 | 9.86 |
| 44860.041666666664 | 9.92 |
| 44860.052083333336 | 10.17 |
| 44860.0625 | 9.27 |
| 44860.072916666664 | 8.07 |
| 44860.083333333336 | 7.63 |
| 44860.09375 | 7.52 |
| 44860.104166666664 | 7.17 |
| 44860.114583333336 | 7.15 |
| 44860.125 | 8.26 |
| 44860.135416666664 | 9.74 |
| 44860.145833333336 | 10.7 |
| 44860.15625 | 11.33 |
| 44860.166666666664 | 14.01 |
| 44860.177083333336 | 11.63 |
| 44860.1875 | 15.94 |
| 44860.197916666664 | 16.34 |
| 44860.208333333336 | 16.49 |
| 44860.21875 | 19.8 |
| 44860.229166666664 | 18.48 |
| 44860.239583333336 | 21.41 |
| 44860.25 | 20.34 |
| 44860.260416666664 | 18.53 |
| 44860.270833333336 | 17.62 |
| 44860.28125 | 37.4 |
| 44860.291666666664 | 49.42 |
| 44860.302083333336 | 17.09 |
| 44860.3125 | 9.95 |
| 44860.322916666664 | 9.1 |
| 44860.333333333336 | 10.09 |
| 44860.34375 | 11.42 |
| 44860.354166666664 | 11.25 |
| 44860.364583333336 | 11.81 |
| 44860.375 | 12.32 |
| 44860.385416666664 | 11.78 |
| 44860.395833333336 | 13.62 |
| 44860.40625 | 12.64 |
| 44860.416666666664 | 12.6 |
| 44860.427083333336 | 12.8 |
| 44860.4375 | 13.23 |
| 44860.447916666664 | 12.49 |
| 44860.458333333336 | 12.62 |
| 44860.46875 | 12.22 |
| 44860.479166666664 | 12.28 |
| 44860.489583333336 | 11.91 |
| 44860.5 | 11.87 |
| 44860.510416666664 | 11.49 |
| 44860.520833333336 | 10.52 |
| 44860.53125 | 10.24 |
| 44860.541666666664 | 9.67 |
| 44860.552083333336 | 10.54 |
| 44860.5625 | 9.24 |
| 44860.572916666664 | 9.5 |
| 44860.583333333336 | 9.44 |
| 44860.59375 | 8.81 |
| 44860.604166666664 | 8.13 |
| 44860.614583333336 | 8.73 |
| 44860.625 | 7.85 |
| 44860.635416666664 | 8.4 |
| 44860.645833333336 | 8.44 |
| 44860.65625 | 8.67 |
| 44860.666666666664 | 50.03 |
| 44860.677083333336 | 9.83 |
| 44860.6875 | 11.99 |
| 44860.697916666664 | 12.03 |
| 44860.708333333336 | 13.48 |
| 44860.71875 | 15.43 |
| 44860.729166666664 | 17.6 |
| 44860.739583333336 | 20.47 |
| 44860.75 | 23.55 |
| 44860.760416666664 | 22.26 |
| 44860.770833333336 | 25.92 |
| 44860.78125 | 22.95 |
| 44860.791666666664 | 25.02 |
| 44860.802083333336 | 17.24 |
| 44860.8125 | 20.24 |
| 44860.822916666664 | 17.5 |
| 44860.833333333336 | 15.5 |
| 44860.84375 | 369.22 |
| 44860.854166666664 | 12.99 |
| 44860.864583333336 | 11.9 |
| 44860.875 | 14.26 |
| 44860.885416666664 | 14.4 |
| 44860.895833333336 | 13.95 |
| 44860.90625 | 12.71 |
| 44860.916666666664 | 14.04 |
| 44860.927083333336 | 13.97 |
| 44860.9375 | 13.25 |
| 44860.947916666664 | 12.59 |
| 44860.958333333336 | 12.62 |
| 44860.96875 | 12.53 |
| 44860.979166666664 | 12.67 |
| 44860.989583333336 | 10.92 |
| 44861.0 | 10.62 |
| 44861.010416666664 | 10.27 |
| 44861.020833333336 | 9.27 |
| 44861.03125 | 9 |
| 44861.041666666664 | 10.89 |
| 44861.052083333336 | 8.94 |
| 44861.0625 | 8.58 |
| 44861.072916666664 | 8.61 |
| 44861.083333333336 | 7.49 |
| 44861.09375 | 7.89 |
| 44861.104166666664 | 7.43 |
| 44861.114583333336 | 6.95 |
| 44861.125 | 7.25 |
| 44861.135416666664 | 7.05 |
| 44861.145833333336 | 7.53 |
| 44861.15625 | 7.85 |
| 44861.166666666664 | 9.39 |
| 44861.177083333336 | 12.6 |
| 44861.1875 | 23.82 |
| 44861.197916666664 | 12.6 |
| 44861.208333333336 | 14.15 |
| 44861.21875 | 16.19 |
| 44861.229166666664 | 18.11 |
| 44861.239583333336 | 17.12 |
| 44861.25 | 18.28 |
| 44861.260416666664 | 17.69 |
| 44861.270833333336 | 18.61 |
| 44861.28125 | 18.96 |
| 44861.291666666664 | 17.26 |
| 44861.302083333336 | 16.78 |
| 44861.3125 | 15.12 |
| 44861.322916666664 | 13.01 |
| 44861.333333333336 | 13.98 |
| 44861.34375 | 12.34 |
| 44861.354166666664 | 11.19 |
| 44861.364583333336 | 11.22 |
| 44861.375 | 12.17 |
| 44861.385416666664 | 12.6 |
| 44861.395833333336 | 13.09 |
| 44861.40625 | 13.19 |
| 44861.416666666664 | 13.2 |
| 44861.427083333336 | 13.58 |
| 44861.4375 | 13.98 |
| 44861.447916666664 | 13.89 |
| 44861.458333333336 | 13.91 |
| 44861.46875 | 13.76 |
| 44861.479166666664 | 14.63 |
| 44861.489583333336 | 13.67 |
| 44861.5 | 15.26 |
| 44861.510416666664 | 15.16 |
| 44861.520833333336 | 14.32 |
| 44861.53125 | 13.2 |
| 44861.541666666664 | 13 |
| 44861.552083333336 | 12.76 |
| 44861.5625 | 12.43 |
| 44861.572916666664 | 28.22 |
| 44861.583333333336 | 10.1 |
| 44861.59375 | 9.34 |
| 44861.604166666664 | 9.05 |
| 44861.614583333336 | 8.26 |
| 44861.625 | 8.44 |
| 44861.635416666664 | 8.32 |
| 44861.645833333336 | 7.49 |
| 44861.65625 | 7.86 |
| 44861.666666666664 | 8.25 |
| 44861.677083333336 | 8.58 |
| 44861.6875 | 8.97 |
| 44861.697916666664 | 9.77 |
| 44861.708333333336 | 9.58 |
| 44861.71875 | 10.93 |
| 44861.729166666664 | 12.46 |
| 44861.739583333336 | 13.78 |
| 44861.75 | 13.96 |
| 44861.760416666664 | 18.07 |
| 44861.770833333336 | 18.66 |
| 44861.78125 | 19.66 |
| 44861.791666666664 | 22.54 |
| 44861.802083333336 | 24.52 |
| 44861.8125 | 24.69 |
| 44861.822916666664 | 23.87 |
| 44861.833333333336 | 23.65 |
| 44861.84375 | 21.04 |
| 44861.854166666664 | 19.65 |
| 44861.864583333336 | 18.97 |
| 44861.875 | 15.52 |
| 44861.885416666664 | 13.13 |
| 44861.895833333336 | 11.68 |
| 44861.90625 | 12.89 |
| 44861.916666666664 | 13.92 |
| 44861.927083333336 | 13.16 |
| 44861.9375 | 12.59 |
| 44861.947916666664 | 13.49 |
| 44861.958333333336 | 12.64 |
| 44861.96875 | 12.73 |
| 44861.979166666664 | 12.24 |
| 44861.989583333336 | 11.79 |
| 44862.0 | 12.73 |
| 44862.010416666664 | 10.73 |
| 44862.020833333336 | 11.82 |
| 44862.03125 | 11.44 |
| 44862.041666666664 | 10.19 |
| 44862.052083333336 | 9.62 |
| 44862.0625 | 9.62 |
| 44862.072916666664 | 24.39 |
| 44862.083333333336 | 8.97 |
| 44862.09375 | 9.03 |
| 44862.104166666664 | 8.86 |
| 44862.114583333336 | 8.48 |
| 44862.125 | 8.4 |
| 44862.135416666664 | 9.02 |
| 44862.145833333336 | 11.01 |
| 44862.15625 | 8.57 |
| 44862.166666666664 | 16.95 |
| 44862.177083333336 | 8.15 |
| 44862.1875 | 9.38 |
| 44862.197916666664 | 10.51 |
| 44862.208333333336 | 11.15 |
| 44862.21875 | 11.11 |
| 44862.229166666664 | 14.45 |
| 44862.239583333336 | 12.3 |
| 44862.25 | 12.1 |
| 44862.260416666664 | 14.05 |
| 44862.270833333336 | 16.18 |
| 44862.28125 | 13.39 |
| 44862.291666666664 | 14.16 |
| 44862.302083333336 | 15.04 |
| 44862.3125 | 15.39 |
| 44862.322916666664 | 16.07 |
| 44862.333333333336 | 15.23 |
| 44862.34375 | 14.7 |
| 44862.354166666664 | 13.54 |
| 44862.364583333336 | 12.77 |
| 44862.375 | 10.54 |
| 44862.385416666664 | 10.16 |
| 44862.395833333336 | 11.27 |
| 44862.40625 | 11.8 |
| 44862.416666666664 | 11.55 |
| 44862.427083333336 | 11.72 |
| 44862.4375 | 12.2 |
| 44862.447916666664 | 12.7 |
| 44862.458333333336 | 12.54 |
| 44862.46875 | 13.2 |
| 44862.479166666664 | 14.29 |
| 44862.489583333336 | 14.12 |
| 44862.5 | 14.18 |
| 44862.510416666664 | 14.34 |
| 44862.520833333336 | 14.36 |
| 44862.53125 | 13.71 |
| 44862.541666666664 | 13.36 |
| 44862.552083333336 | 12.83 |
| 44862.5625 | 11.63 |
| 44862.572916666664 | 10.76 |
| 44862.583333333336 | 10.25 |
| 44862.59375 | 10.06 |
| 44862.604166666664 | 9.52 |
| 44862.614583333336 | 9.67 |
| 44862.625 | 9.46 |
| 44862.635416666664 | 9.82 |
| 44862.645833333336 | 11.35 |
| 44862.65625 | 16.12 |
| 44862.666666666664 | 202.13 |
| 44862.677083333336 | 34.44 |
| 44862.6875 | 23.39 |
| 44862.697916666664 | 19.16 |
| 44862.708333333336 | 31.41 |
| 44862.71875 | 11.02 |
| 44862.729166666664 | 11.48 |
| 44862.739583333336 | 11.81 |
| 44862.75 | 10.66 |
| 44862.760416666664 | 11.21 |
| 44862.770833333336 | 12.03 |
| 44862.78125 | 12.42 |
| 44862.791666666664 | 13.82 |
| 44862.802083333336 | 14.88 |
| 44862.8125 | 12.69 |
| 44862.822916666664 | 20.22 |
| 44862.833333333336 | 17.7 |
| 44862.84375 | 23.74 |
| 44862.854166666664 | 26.58 |
| 44862.864583333336 | 23.01 |
| 44862.875 | 26.21 |
| 44862.885416666664 | 30.3 |
| 44862.895833333336 | 27.23 |
| 44862.90625 | 26.09 |
| 44862.916666666664 | 21.02 |
| 44862.927083333336 | 19.96 |
| 44862.9375 | 17.87 |
| 44862.947916666664 | 13.66 |
| 44862.958333333336 | 14.92 |
| 44862.96875 | 11.88 |
| 44862.979166666664 | 12.16 |
| 44862.989583333336 | 12.29 |
| 44863.0 | 12.49 |
| 44863.010416666664 | 13.09 |
| 44863.020833333336 | 12.46 |
| 44863.03125 | 12.57 |
| 44863.041666666664 | 12.4 |
| 44863.052083333336 | 72.43 |
| 44863.0625 | 15.28 |
| 44863.072916666664 | 14.36 |
| 44863.083333333336 | 12.78 |
| 44863.09375 | 10.36 |
| 44863.104166666664 | 9.83 |
| 44863.114583333336 | 9.59 |
| 44863.125 | 9.65 |
| 44863.135416666664 | 9.47 |
| 44863.145833333336 | 9.31 |
| 44863.15625 | 9.36 |
| 44863.166666666664 | 8.79 |
| 44863.177083333336 | 7.64 |
| 44863.1875 | 7.88 |
| 44863.197916666664 | 7.85 |
| 44863.208333333336 | 7.86 |
| 44863.21875 | 8.14 |
| 44863.229166666664 | 9.1 |
| 44863.239583333336 | 9.55 |
| 44863.25 | 10.38 |
| 44863.260416666664 | 25.7 |
| 44863.270833333336 | 12.36 |
| 44863.28125 | 12.47 |
| 44863.291666666664 | 15.46 |
| 44863.302083333336 | 12.21 |
| 44863.3125 | 12.5 |
| 44863.322916666664 | 13.54 |
| 44863.333333333336 | 16.39 |
| 44863.34375 | 15.2 |
| 44863.354166666664 | 17.21 |
| 44863.364583333336 | 14.37 |
| 44863.375 | 21.43 |
| 44863.385416666664 | 349.97 |
| 44863.395833333336 | 13.61 |
| 44863.40625 | 11.72 |
| 44863.416666666664 | 11.61 |
| 44863.427083333336 | 9.93 |
| 44863.4375 | 16.29 |
| 44863.447916666664 | 11.01 |
| 44863.458333333336 | 11.6 |
| 44863.46875 | 11.16 |
| 44863.479166666664 | 11.77 |
| 44863.489583333336 | 12.2 |
| 44863.5 | 12.62 |
| 44863.510416666664 | 11.43 |
| 44863.520833333336 | 12.41 |
| 44863.53125 | 13 |
| 44863.541666666664 | 11.38 |
| 44863.552083333336 | 11.4 |
| 44863.5625 | 11.36 |
| 44863.572916666664 | 10.74 |
| 44863.583333333336 | 11 |
| 44863.59375 | 10.65 |
| 44863.604166666664 | 9.67 |
| 44863.614583333336 | 9.35 |
| 44863.625 | 9.24 |
| 44863.635416666664 | 8.69 |
| 44863.645833333336 | 8.25 |
| 44863.65625 | 8.95 |
| 44863.666666666664 | 7.83 |
| 44863.677083333336 | 8.09 |
| 44863.6875 | 8.16 |
| 44863.697916666664 | 8.57 |
| 44863.708333333336 | 9.32 |
| 44863.71875 | 8.85 |
| 44863.729166666664 | 8.88 |
| 44863.739583333336 | 10.01 |
| 44863.75 | 13.25 |
| 44863.760416666664 | 11.79 |
| 44863.770833333336 | 10.65 |
| 44863.78125 | 26.49 |
| 44863.791666666664 | 9.72 |
| 44863.802083333336 | 12.64 |
| 44863.8125 | 11.83 |
| 44863.822916666664 | 13.99 |
| 44863.833333333336 | 13.15 |
| 44863.84375 | 16.67 |
| 44863.854166666664 | 15.94 |
| 44863.864583333336 | 17.18 |
| 44863.875 | 19.94 |
| 44863.885416666664 | 20.93 |
| 44863.895833333336 | 22.6 |
| 44863.90625 | 22.18 |
| 44863.916666666664 | 21.09 |
| 44863.927083333336 | 18.93 |
| 44863.9375 | 16.51 |
| 44863.947916666664 | 15.48 |
| 44863.958333333336 | 13.16 |
| 44863.96875 | 9.93 |
| 44863.979166666664 | 11.3 |
| 44863.989583333336 | 11.89 |
| 44864.0 | 10.57 |
| 44864.010416666664 | 11.51 |
| 44864.020833333336 | 11.83 |
| 44864.03125 | 10.19 |
| 44864.041666666664 | 10.23 |
| 44864.052083333336 | 10.28 |
| 44864.0625 | 9.51 |
| 44864.072916666664 | 10.18 |
| 44864.083333333336 | 9.23 |
| 44864.09375 | 8.88 |
| 44864.104166666664 | 8.78 |
| 44864.114583333336 | 31.79 |
| 44864.125 | 20.56 |
| 44864.135416666664 | 103.11 |
| 44864.145833333336 | 167.58 |
| 44864.15625 | 35.7 |
| 44864.166666666664 | 19.57 |
| 44864.177083333336 | 14.41 |
| 44864.1875 | 13.34 |
| 44864.197916666664 | 7.07 |
| 44864.208333333336 | 7.93 |
| 44864.21875 | 6.26 |
| 44864.229166666664 | 6.58 |
| 44864.239583333336 | 7.02 |
| 44864.25 | 7.64 |
| 44864.260416666664 | 36.92 |
| 44864.270833333336 | 47.8 |
| 44864.28125 | 109.97 |
| 44864.291666666664 | 9.25 |
| 44864.302083333336 | 9.87 |
| 44864.3125 | 9.55 |
| 44864.322916666664 | 10.98 |
| 44864.333333333336 | 10.53 |
| 44864.34375 | 12.22 |
| 44864.354166666664 | 10.76 |
| 44864.364583333336 | 10.6 |
| 44864.375 | 11.73 |
| 44864.385416666664 | 12.19 |
| 44864.395833333336 | 11.83 |
| 44864.40625 | 11.96 |
| 44864.416666666664 | 11.47 |
| 44864.427083333336 | 10.84 |
| 44864.4375 | 11.47 |
| 44864.447916666664 | 9.52 |
| 44864.458333333336 | 10.16 |
| 44864.46875 | 21.3 |
| 44864.479166666664 | 9.23 |
| 44864.489583333336 | 10.13 |
| 44864.5 | 11.05 |
| 44864.510416666664 | 11.09 |
| 44864.520833333336 | 10.63 |
| 44864.53125 | 10.99 |
| 44864.541666666664 | 12.43 |
| 44864.552083333336 | 10.35 |
| 44864.5625 | 11.24 |
| 44864.572916666664 | 43.99 |
| 44864.583333333336 | 10.15 |
| 44864.59375 | 10.12 |
| 44864.604166666664 | 10.16 |
| 44864.614583333336 | 9.9 |
| 44864.625 | 9.98 |
| 44864.635416666664 | 9.41 |
| 44864.645833333336 | 10.53 |
| 44864.65625 | 8.18 |
| 44864.666666666664 | 8.22 |
| 44864.677083333336 | 8.37 |
| 44864.6875 | 8.31 |
| 44864.697916666664 | 8.83 |
| 44864.708333333336 | 8.18 |
| 44864.71875 | 7.87 |
| 44864.729166666664 | 8.35 |
| 44864.739583333336 | 8.5 |
| 44864.75 | 13.69 |
| 44864.760416666664 | 7.56 |
| 44864.770833333336 | 10.55 |
| 44864.78125 | 7.86 |
| 44864.791666666664 | 8.28 |
| 44864.802083333336 | 8.57 |
| 44864.8125 | 9.34 |
| 44864.822916666664 | 9.77 |
| 44864.833333333336 | 11.2 |
| 44864.84375 | 11.48 |
| 44864.854166666664 | 12.48 |
| 44864.864583333336 | 13.27 |
| 44864.875 | 14.21 |
| 44864.885416666664 | 14.34 |
| 44864.895833333336 | 624.47 |
| 44864.90625 | 26.01 |
| 44864.916666666664 | 15.5 |
| 44864.927083333336 | 146.36 |
| 44864.9375 | 14.96 |
| 44864.947916666664 | 17.97 |
| 44864.958333333336 | 98.46 |
| 44864.96875 | 102.1 |
| 44864.979166666664 | 11.56 |
| 44864.989583333336 | 9.78 |
| 44865.0 | 8.77 |
| 44865.010416666664 | 9.56 |
| 44865.020833333336 | 9.07 |
| 44865.03125 | 41.67 |
| 44865.041666666664 | 9.55 |
| 44865.052083333336 | 9.58 |
| 44865.0625 | 9.09 |
| 44865.072916666664 | 8.98 |
| 44865.083333333336 | 9.54 |
| 44865.09375 | 9.3 |
| 44865.104166666664 | 9.02 |
| 44865.114583333336 | 8.55 |
| 44865.125 | 8.64 |
| 44865.135416666664 | 9.29 |
| 44865.145833333336 | 9.04 |
| 44865.15625 | 9.04 |
| 44865.166666666664 | 9.23 |
| 44865.177083333336 | 9.08 |
| 44865.1875 | 9.44 |
| 44865.197916666664 | 9.16 |
| 44865.208333333336 | 9.09 |
| 44865.21875 | 8.78 |
| 44865.229166666664 | 8.06 |
| 44865.239583333336 | 8.07 |
| 44865.25 | 7.82 |
| 44865.260416666664 | 8 |
| 44865.270833333336 | 7 |
| 44865.28125 | 7.55 |
| 44865.291666666664 | 7.85 |
| 44865.302083333336 | 8.33 |
| 44865.3125 | 8.44 |
| 44865.322916666664 | 8.53 |
| 44865.333333333336 | 9.95 |
| 44865.34375 | 9.4 |
| 44865.354166666664 | 9.88 |
| 44865.364583333336 | 10.73 |
| 44865.375 | 11.35 |
| 44865.385416666664 | 10.62 |
| 44865.395833333336 | 12.38 |
| 44865.40625 | 12.07 |
| 44865.416666666664 | 12.86 |
| 44865.427083333336 | 13.34 |
| 44865.4375 | 13.53 |
| 44865.447916666664 | 12.23 |
| 44865.458333333336 | 12.56 |
| 44865.46875 | 12.63 |
| 44865.479166666664 | 17.88 |
| 44865.489583333336 | 12.17 |
| 44865.5 | 10.8 |
| 44865.510416666664 | 11.99 |
| 44865.520833333336 | 17.1 |
| 44865.53125 | 11.24 |
| 44865.541666666664 | 10.61 |
| 44865.552083333336 | 11.37 |
| 44865.5625 | 11.15 |
| 44865.572916666664 | 10.47 |
| 44865.583333333336 | 10.51 |
| 44865.59375 | 10.05 |
| 44865.604166666664 | 10.04 |
| 44865.614583333336 | 10.11 |
| 44865.625 | 10.05 |
| 44865.635416666664 | 10.33 |
| 44865.645833333336 | 9.59 |
| 44865.65625 | 10.14 |
| 44865.666666666664 | 9.11 |
| 44865.677083333336 | 9.58 |
| 44865.6875 | 8.6 |
| 44865.697916666664 | 9.13 |
| 44865.708333333336 | 9.07 |
| 44865.71875 | 8.28 |
| 44865.729166666664 | 7.86 |
| 44865.739583333336 | 8.16 |
| 44865.75 | 8.36 |
| 44865.760416666664 | 8.39 |
| 44865.770833333336 | 8.45 |
| 44865.78125 | 9.91 |
| 44865.791666666664 | 7.34 |
| 44865.802083333336 | 7.03 |
| 44865.8125 | 11.81 |
| 44865.822916666664 | 10.05 |
| 44865.833333333336 | 9.31 |
| 44865.84375 | 9.19 |
| 44865.854166666664 | 9.93 |
| 44865.864583333336 | 10.88 |
| 44865.875 | 10.96 |
| 44865.885416666664 | 11.94 |
| 44865.895833333336 | 12.51 |
| 44865.90625 | 33.82 |
| 44865.916666666664 | 13.53 |
| 44865.927083333336 | 14.71 |
| 44865.9375 | 14.17 |
| 44865.947916666664 | 15.31 |
| 44865.958333333336 | 15.22 |
| 44865.96875 | 15.58 |
| 44865.979166666664 | 14.44 |
| 44865.989583333336 | 15.83 |
| 44866.0 | 14.75 |
| 44866.010416666664 | 14.03 |
| 44866.020833333336 | 13.5 |
| 44866.03125 | 12.97 |
| 44866.041666666664 | 12.94 |
| 44866.052083333336 | 11.56 |
| 44866.0625 | 15.04 |
| 44866.072916666664 | 12.87 |
| 44866.083333333336 | 174.74 |
| 44866.09375 | 10.19 |
| 44866.104166666664 | 10.15 |
| 44866.114583333336 | 10.32 |
| 44866.125 | 10.43 |
| 44866.135416666664 | 10.13 |
| 44866.145833333336 | 8.76 |